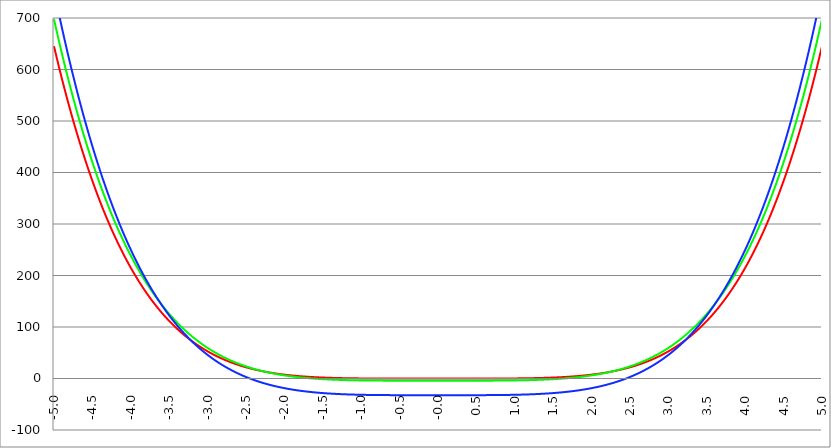
| Category | Series 1 | Series 0 | Series 2 |
|---|---|---|---|
| -5.0 | 645.196 | 697.558 | 753.359 |
| -4.995 | 642.015 | 694.199 | 749.721 |
| -4.99 | 638.847 | 690.853 | 746.097 |
| -4.985 | 635.692 | 687.519 | 742.487 |
| -4.98 | 632.549 | 684.199 | 738.89 |
| -4.975 | 629.419 | 680.891 | 735.307 |
| -4.97 | 626.301 | 677.597 | 731.737 |
| -4.965000000000001 | 623.195 | 674.315 | 728.18 |
| -4.960000000000001 | 620.102 | 671.045 | 724.637 |
| -4.955000000000001 | 617.021 | 667.789 | 721.107 |
| -4.950000000000001 | 613.952 | 664.545 | 717.59 |
| -4.945000000000001 | 610.896 | 661.313 | 714.086 |
| -4.940000000000001 | 607.852 | 658.095 | 710.596 |
| -4.935000000000001 | 604.82 | 654.888 | 707.119 |
| -4.930000000000001 | 601.8 | 651.695 | 703.655 |
| -4.925000000000002 | 598.792 | 648.514 | 700.204 |
| -4.920000000000002 | 595.796 | 645.345 | 696.766 |
| -4.915000000000002 | 592.813 | 642.188 | 693.341 |
| -4.910000000000002 | 589.841 | 639.044 | 689.929 |
| -4.905000000000002 | 586.881 | 635.913 | 686.53 |
| -4.900000000000002 | 583.934 | 632.793 | 683.144 |
| -4.895000000000002 | 580.998 | 629.686 | 679.77 |
| -4.890000000000002 | 578.074 | 626.591 | 676.41 |
| -4.885000000000002 | 575.161 | 623.509 | 673.062 |
| -4.880000000000002 | 572.261 | 620.438 | 669.727 |
| -4.875000000000003 | 569.372 | 617.379 | 666.405 |
| -4.870000000000003 | 566.495 | 614.333 | 663.095 |
| -4.865000000000003 | 563.63 | 611.299 | 659.798 |
| -4.860000000000003 | 560.776 | 608.276 | 656.514 |
| -4.855000000000003 | 557.934 | 605.266 | 653.242 |
| -4.850000000000003 | 555.104 | 602.267 | 649.983 |
| -4.845000000000003 | 552.285 | 599.281 | 646.736 |
| -4.840000000000003 | 549.477 | 596.306 | 643.502 |
| -4.835000000000003 | 546.681 | 593.343 | 640.28 |
| -4.830000000000004 | 543.897 | 590.392 | 637.07 |
| -4.825000000000004 | 541.123 | 587.453 | 633.873 |
| -4.820000000000004 | 538.362 | 584.525 | 630.688 |
| -4.815000000000004 | 535.611 | 581.609 | 627.516 |
| -4.810000000000004 | 532.872 | 578.705 | 624.355 |
| -4.805000000000004 | 530.144 | 575.812 | 621.207 |
| -4.800000000000004 | 527.427 | 572.931 | 618.071 |
| -4.795000000000004 | 524.721 | 570.061 | 614.947 |
| -4.790000000000004 | 522.027 | 567.203 | 611.835 |
| -4.785000000000004 | 519.344 | 564.356 | 608.735 |
| -4.780000000000004 | 516.671 | 561.521 | 605.648 |
| -4.775000000000004 | 514.01 | 558.697 | 602.572 |
| -4.770000000000004 | 511.36 | 555.885 | 599.508 |
| -4.765000000000005 | 508.721 | 553.084 | 596.456 |
| -4.760000000000005 | 506.092 | 550.294 | 593.416 |
| -4.755000000000005 | 503.475 | 547.515 | 590.388 |
| -4.750000000000005 | 500.868 | 544.748 | 587.372 |
| -4.745000000000005 | 498.273 | 541.992 | 584.367 |
| -4.740000000000005 | 495.688 | 539.247 | 581.374 |
| -4.735000000000005 | 493.114 | 536.513 | 578.393 |
| -4.730000000000005 | 490.55 | 533.79 | 575.424 |
| -4.725000000000006 | 487.997 | 531.078 | 572.466 |
| -4.720000000000006 | 485.455 | 528.378 | 569.519 |
| -4.715000000000006 | 482.924 | 525.688 | 566.585 |
| -4.710000000000006 | 480.403 | 523.009 | 563.661 |
| -4.705000000000006 | 477.893 | 520.341 | 560.75 |
| -4.700000000000006 | 475.393 | 517.684 | 557.85 |
| -4.695000000000006 | 472.904 | 515.038 | 554.961 |
| -4.690000000000006 | 470.425 | 512.403 | 552.083 |
| -4.685000000000007 | 467.957 | 509.778 | 549.217 |
| -4.680000000000007 | 465.499 | 507.164 | 546.363 |
| -4.675000000000007 | 463.051 | 504.561 | 543.519 |
| -4.670000000000007 | 460.614 | 501.969 | 540.687 |
| -4.665000000000007 | 458.187 | 499.387 | 537.866 |
| -4.660000000000007 | 455.771 | 496.816 | 535.056 |
| -4.655000000000007 | 453.364 | 494.256 | 532.258 |
| -4.650000000000007 | 450.968 | 491.706 | 529.47 |
| -4.645000000000007 | 448.582 | 489.166 | 526.694 |
| -4.640000000000008 | 446.206 | 486.637 | 523.928 |
| -4.635000000000008 | 443.84 | 484.119 | 521.174 |
| -4.630000000000008 | 441.485 | 481.61 | 518.431 |
| -4.625000000000008 | 439.139 | 479.113 | 515.698 |
| -4.620000000000008 | 436.803 | 476.625 | 512.977 |
| -4.615000000000008 | 434.478 | 474.148 | 510.266 |
| -4.610000000000008 | 432.162 | 471.682 | 507.566 |
| -4.605000000000008 | 429.856 | 469.225 | 504.878 |
| -4.600000000000008 | 427.56 | 466.779 | 502.199 |
| -4.595000000000009 | 425.274 | 464.343 | 499.532 |
| -4.590000000000009 | 422.998 | 461.917 | 496.875 |
| -4.585000000000009 | 420.731 | 459.501 | 494.229 |
| -4.580000000000009 | 418.475 | 457.095 | 491.594 |
| -4.57500000000001 | 416.228 | 454.7 | 488.969 |
| -4.57000000000001 | 413.99 | 452.314 | 486.355 |
| -4.565000000000009 | 411.763 | 449.938 | 483.752 |
| -4.560000000000009 | 409.544 | 447.573 | 481.159 |
| -4.555000000000009 | 407.336 | 445.217 | 478.576 |
| -4.55000000000001 | 405.137 | 442.871 | 476.004 |
| -4.54500000000001 | 402.948 | 440.535 | 473.442 |
| -4.54000000000001 | 400.768 | 438.209 | 470.891 |
| -4.53500000000001 | 398.598 | 435.893 | 468.35 |
| -4.53000000000001 | 396.437 | 433.587 | 465.82 |
| -4.52500000000001 | 394.285 | 431.29 | 463.3 |
| -4.52000000000001 | 392.143 | 429.003 | 460.79 |
| -4.51500000000001 | 390.01 | 426.725 | 458.29 |
| -4.51000000000001 | 387.887 | 424.458 | 455.8 |
| -4.505000000000011 | 385.772 | 422.2 | 453.321 |
| -4.500000000000011 | 383.668 | 419.951 | 450.852 |
| -4.495000000000011 | 381.572 | 417.712 | 448.393 |
| -4.490000000000011 | 379.485 | 415.483 | 445.943 |
| -4.485000000000011 | 377.408 | 413.263 | 443.504 |
| -4.480000000000011 | 375.34 | 411.053 | 441.076 |
| -4.475000000000011 | 373.281 | 408.852 | 438.657 |
| -4.470000000000011 | 371.23 | 406.66 | 436.247 |
| -4.465000000000011 | 369.189 | 404.478 | 433.848 |
| -4.460000000000011 | 367.157 | 402.305 | 431.459 |
| -4.455000000000012 | 365.134 | 400.141 | 429.08 |
| -4.450000000000012 | 363.12 | 397.987 | 426.71 |
| -4.445000000000012 | 361.115 | 395.842 | 424.35 |
| -4.440000000000012 | 359.119 | 393.706 | 422 |
| -4.435000000000012 | 357.132 | 391.58 | 419.66 |
| -4.430000000000012 | 355.153 | 389.462 | 417.33 |
| -4.425000000000012 | 353.183 | 387.354 | 415.009 |
| -4.420000000000012 | 351.222 | 385.255 | 412.698 |
| -4.415000000000012 | 349.27 | 383.165 | 410.396 |
| -4.410000000000013 | 347.327 | 381.084 | 408.104 |
| -4.405000000000013 | 345.392 | 379.012 | 405.822 |
| -4.400000000000013 | 343.466 | 376.949 | 403.549 |
| -4.395000000000013 | 341.548 | 374.895 | 401.285 |
| -4.390000000000013 | 339.639 | 372.85 | 399.031 |
| -4.385000000000013 | 337.739 | 370.813 | 396.787 |
| -4.380000000000013 | 335.847 | 368.786 | 394.551 |
| -4.375000000000013 | 333.964 | 366.767 | 392.326 |
| -4.370000000000013 | 332.089 | 364.758 | 390.109 |
| -4.365000000000013 | 330.223 | 362.757 | 387.902 |
| -4.360000000000014 | 328.365 | 360.764 | 385.704 |
| -4.355000000000014 | 326.515 | 358.781 | 383.516 |
| -4.350000000000014 | 324.674 | 356.806 | 381.336 |
| -4.345000000000014 | 322.841 | 354.84 | 379.166 |
| -4.340000000000014 | 321.017 | 352.882 | 377.005 |
| -4.335000000000014 | 319.2 | 350.934 | 374.853 |
| -4.330000000000014 | 317.392 | 348.993 | 372.71 |
| -4.325000000000014 | 315.593 | 347.061 | 370.577 |
| -4.320000000000014 | 313.801 | 345.138 | 368.452 |
| -4.315000000000015 | 312.018 | 343.223 | 366.336 |
| -4.310000000000015 | 310.242 | 341.317 | 364.23 |
| -4.305000000000015 | 308.475 | 339.419 | 362.132 |
| -4.300000000000015 | 306.716 | 337.53 | 360.043 |
| -4.295000000000015 | 304.965 | 335.649 | 357.963 |
| -4.290000000000015 | 303.222 | 333.776 | 355.892 |
| -4.285000000000015 | 301.487 | 331.912 | 353.83 |
| -4.280000000000015 | 299.76 | 330.056 | 351.777 |
| -4.275000000000015 | 298.041 | 328.208 | 349.732 |
| -4.270000000000015 | 296.33 | 326.368 | 347.696 |
| -4.265000000000016 | 294.627 | 324.537 | 345.669 |
| -4.260000000000016 | 292.932 | 322.714 | 343.651 |
| -4.255000000000016 | 291.244 | 320.898 | 341.641 |
| -4.250000000000016 | 289.564 | 319.092 | 339.64 |
| -4.245000000000016 | 287.892 | 317.293 | 337.648 |
| -4.240000000000016 | 286.228 | 315.502 | 335.664 |
| -4.235000000000016 | 284.572 | 313.719 | 333.689 |
| -4.230000000000016 | 282.923 | 311.945 | 331.722 |
| -4.225000000000017 | 281.282 | 310.178 | 329.764 |
| -4.220000000000017 | 279.649 | 308.419 | 327.814 |
| -4.215000000000017 | 278.023 | 306.668 | 325.873 |
| -4.210000000000017 | 276.404 | 304.925 | 323.94 |
| -4.205000000000017 | 274.794 | 303.19 | 322.015 |
| -4.200000000000017 | 273.191 | 301.463 | 320.099 |
| -4.195000000000017 | 271.595 | 299.744 | 318.191 |
| -4.190000000000017 | 270.007 | 298.032 | 316.292 |
| -4.185000000000017 | 268.426 | 296.329 | 314.4 |
| -4.180000000000017 | 266.853 | 294.633 | 312.517 |
| -4.175000000000018 | 265.287 | 292.944 | 310.643 |
| -4.170000000000018 | 263.729 | 291.264 | 308.776 |
| -4.165000000000018 | 262.178 | 289.591 | 306.918 |
| -4.160000000000018 | 260.634 | 287.925 | 305.067 |
| -4.155000000000018 | 259.098 | 286.268 | 303.225 |
| -4.150000000000018 | 257.569 | 284.618 | 301.391 |
| -4.145000000000018 | 256.047 | 282.975 | 299.565 |
| -4.140000000000018 | 254.532 | 281.34 | 297.747 |
| -4.135000000000018 | 253.025 | 279.713 | 295.937 |
| -4.130000000000019 | 251.524 | 278.093 | 294.136 |
| -4.125000000000019 | 250.031 | 276.48 | 292.342 |
| -4.120000000000019 | 248.545 | 274.875 | 290.555 |
| -4.115000000000019 | 247.066 | 273.277 | 288.777 |
| -4.110000000000019 | 245.594 | 271.687 | 287.007 |
| -4.105000000000019 | 244.129 | 270.104 | 285.245 |
| -4.100000000000019 | 242.672 | 268.528 | 283.49 |
| -4.095000000000019 | 241.221 | 266.96 | 281.743 |
| -4.090000000000019 | 239.777 | 265.399 | 280.004 |
| -4.085000000000019 | 238.34 | 263.845 | 278.273 |
| -4.08000000000002 | 236.91 | 262.298 | 276.549 |
| -4.07500000000002 | 235.487 | 260.759 | 274.833 |
| -4.07000000000002 | 234.071 | 259.227 | 273.125 |
| -4.06500000000002 | 232.662 | 257.701 | 271.424 |
| -4.06000000000002 | 231.259 | 256.183 | 269.731 |
| -4.05500000000002 | 229.863 | 254.673 | 268.046 |
| -4.05000000000002 | 228.474 | 253.169 | 266.368 |
| -4.04500000000002 | 227.092 | 251.672 | 264.698 |
| -4.04000000000002 | 225.716 | 250.182 | 263.035 |
| -4.03500000000002 | 224.348 | 248.699 | 261.38 |
| -4.03000000000002 | 222.985 | 247.224 | 259.732 |
| -4.025000000000021 | 221.63 | 245.755 | 258.092 |
| -4.020000000000021 | 220.281 | 244.293 | 256.459 |
| -4.015000000000021 | 218.939 | 242.838 | 254.833 |
| -4.010000000000021 | 217.603 | 241.39 | 253.215 |
| -4.005000000000021 | 216.274 | 239.948 | 251.604 |
| -4.000000000000021 | 214.951 | 238.514 | 250 |
| -3.995000000000021 | 213.635 | 237.086 | 248.404 |
| -3.990000000000021 | 212.325 | 235.665 | 246.815 |
| -3.985000000000022 | 211.022 | 234.251 | 245.233 |
| -3.980000000000022 | 209.725 | 232.844 | 243.658 |
| -3.975000000000022 | 208.435 | 231.443 | 242.09 |
| -3.970000000000022 | 207.151 | 230.049 | 240.53 |
| -3.965000000000022 | 205.873 | 228.661 | 238.977 |
| -3.960000000000022 | 204.602 | 227.281 | 237.431 |
| -3.955000000000022 | 203.337 | 225.907 | 235.892 |
| -3.950000000000022 | 202.078 | 224.539 | 234.36 |
| -3.945000000000022 | 200.826 | 223.178 | 232.835 |
| -3.940000000000023 | 199.58 | 221.823 | 231.317 |
| -3.935000000000023 | 198.34 | 220.475 | 229.806 |
| -3.930000000000023 | 197.106 | 219.134 | 228.302 |
| -3.925000000000023 | 195.878 | 217.799 | 226.805 |
| -3.920000000000023 | 194.657 | 216.47 | 225.315 |
| -3.915000000000023 | 193.441 | 215.148 | 223.832 |
| -3.910000000000023 | 192.232 | 213.832 | 222.355 |
| -3.905000000000023 | 191.029 | 212.523 | 220.886 |
| -3.900000000000023 | 189.832 | 211.219 | 219.423 |
| -3.895000000000023 | 188.64 | 209.923 | 217.967 |
| -3.890000000000024 | 187.455 | 208.632 | 216.518 |
| -3.885000000000024 | 186.276 | 207.348 | 215.075 |
| -3.880000000000024 | 185.103 | 206.07 | 213.639 |
| -3.875000000000024 | 183.936 | 204.798 | 212.21 |
| -3.870000000000024 | 182.774 | 203.533 | 210.788 |
| -3.865000000000024 | 181.619 | 202.273 | 209.372 |
| -3.860000000000024 | 180.469 | 201.02 | 207.963 |
| -3.855000000000024 | 179.326 | 199.773 | 206.561 |
| -3.850000000000024 | 178.188 | 198.532 | 205.165 |
| -3.845000000000025 | 177.056 | 197.297 | 203.775 |
| -3.840000000000025 | 175.929 | 196.068 | 202.392 |
| -3.835000000000025 | 174.809 | 194.846 | 201.016 |
| -3.830000000000025 | 173.694 | 193.629 | 199.646 |
| -3.825000000000025 | 172.585 | 192.418 | 198.283 |
| -3.820000000000025 | 171.482 | 191.213 | 196.926 |
| -3.815000000000025 | 170.384 | 190.015 | 195.575 |
| -3.810000000000025 | 169.292 | 188.822 | 194.231 |
| -3.805000000000025 | 168.205 | 187.635 | 192.893 |
| -3.800000000000026 | 167.124 | 186.454 | 191.562 |
| -3.795000000000026 | 166.049 | 185.278 | 190.237 |
| -3.790000000000026 | 164.979 | 184.109 | 188.918 |
| -3.785000000000026 | 163.915 | 182.945 | 187.605 |
| -3.780000000000026 | 162.857 | 181.788 | 186.299 |
| -3.775000000000026 | 161.803 | 180.636 | 184.999 |
| -3.770000000000026 | 160.756 | 179.489 | 183.705 |
| -3.765000000000026 | 159.714 | 178.349 | 182.417 |
| -3.760000000000026 | 158.677 | 177.214 | 181.136 |
| -3.755000000000026 | 157.645 | 176.085 | 179.86 |
| -3.750000000000027 | 156.619 | 174.962 | 178.591 |
| -3.745000000000027 | 155.599 | 173.844 | 177.328 |
| -3.740000000000027 | 154.583 | 172.732 | 176.071 |
| -3.735000000000027 | 153.573 | 171.625 | 174.819 |
| -3.730000000000027 | 152.569 | 170.524 | 173.574 |
| -3.725000000000027 | 151.569 | 169.429 | 172.335 |
| -3.720000000000027 | 150.575 | 168.339 | 171.102 |
| -3.715000000000027 | 149.586 | 167.255 | 169.875 |
| -3.710000000000027 | 148.603 | 166.176 | 168.654 |
| -3.705000000000028 | 147.624 | 165.102 | 167.439 |
| -3.700000000000028 | 146.651 | 164.034 | 166.229 |
| -3.695000000000028 | 145.683 | 162.972 | 165.026 |
| -3.690000000000028 | 144.72 | 161.915 | 163.828 |
| -3.685000000000028 | 143.762 | 160.863 | 162.637 |
| -3.680000000000028 | 142.809 | 159.817 | 161.451 |
| -3.675000000000028 | 141.861 | 158.776 | 160.27 |
| -3.670000000000028 | 140.919 | 157.74 | 159.096 |
| -3.665000000000028 | 139.981 | 156.71 | 157.927 |
| -3.660000000000028 | 139.049 | 155.685 | 156.764 |
| -3.655000000000029 | 138.121 | 154.665 | 155.607 |
| -3.650000000000029 | 137.198 | 153.65 | 154.456 |
| -3.645000000000029 | 136.281 | 152.641 | 153.31 |
| -3.640000000000029 | 135.368 | 151.637 | 152.169 |
| -3.635000000000029 | 134.46 | 150.638 | 151.035 |
| -3.630000000000029 | 133.557 | 149.644 | 149.906 |
| -3.625000000000029 | 132.659 | 148.655 | 148.782 |
| -3.620000000000029 | 131.766 | 147.672 | 147.664 |
| -3.615000000000029 | 130.878 | 146.694 | 146.552 |
| -3.61000000000003 | 129.994 | 145.72 | 145.445 |
| -3.60500000000003 | 129.115 | 144.752 | 144.344 |
| -3.60000000000003 | 128.241 | 143.789 | 143.248 |
| -3.59500000000003 | 127.372 | 142.831 | 142.157 |
| -3.59000000000003 | 126.508 | 141.877 | 141.072 |
| -3.58500000000003 | 125.648 | 140.929 | 139.993 |
| -3.58000000000003 | 124.793 | 139.986 | 138.918 |
| -3.57500000000003 | 123.942 | 139.048 | 137.85 |
| -3.57000000000003 | 123.097 | 138.114 | 136.786 |
| -3.565000000000031 | 122.255 | 137.186 | 135.728 |
| -3.560000000000031 | 121.419 | 136.262 | 134.675 |
| -3.555000000000031 | 120.587 | 135.343 | 133.627 |
| -3.550000000000031 | 119.76 | 134.429 | 132.585 |
| -3.545000000000031 | 118.937 | 133.52 | 131.548 |
| -3.540000000000031 | 118.119 | 132.616 | 130.516 |
| -3.535000000000031 | 117.305 | 131.717 | 129.489 |
| -3.530000000000031 | 116.496 | 130.822 | 128.468 |
| -3.525000000000031 | 115.691 | 129.932 | 127.452 |
| -3.520000000000032 | 114.891 | 129.047 | 126.441 |
| -3.515000000000032 | 114.095 | 128.166 | 125.435 |
| -3.510000000000032 | 113.304 | 127.291 | 124.434 |
| -3.505000000000032 | 112.517 | 126.419 | 123.438 |
| -3.500000000000032 | 111.735 | 125.553 | 122.447 |
| -3.495000000000032 | 110.956 | 124.691 | 121.461 |
| -3.490000000000032 | 110.183 | 123.834 | 120.481 |
| -3.485000000000032 | 109.413 | 122.981 | 119.505 |
| -3.480000000000032 | 108.648 | 122.133 | 118.534 |
| -3.475000000000032 | 107.887 | 121.29 | 117.569 |
| -3.470000000000033 | 107.131 | 120.451 | 116.608 |
| -3.465000000000033 | 106.378 | 119.616 | 115.652 |
| -3.460000000000033 | 105.63 | 118.786 | 114.701 |
| -3.455000000000033 | 104.886 | 117.961 | 113.755 |
| -3.450000000000033 | 104.147 | 117.14 | 112.814 |
| -3.445000000000033 | 103.411 | 116.323 | 111.878 |
| -3.440000000000033 | 102.68 | 115.511 | 110.946 |
| -3.435000000000033 | 101.953 | 114.703 | 110.02 |
| -3.430000000000033 | 101.23 | 113.9 | 109.098 |
| -3.425000000000034 | 100.511 | 113.101 | 108.181 |
| -3.420000000000034 | 99.797 | 112.307 | 107.269 |
| -3.415000000000034 | 99.086 | 111.516 | 106.361 |
| -3.410000000000034 | 98.379 | 110.73 | 105.458 |
| -3.405000000000034 | 97.677 | 109.949 | 104.56 |
| -3.400000000000034 | 96.978 | 109.171 | 103.667 |
| -3.395000000000034 | 96.284 | 108.398 | 102.778 |
| -3.390000000000034 | 95.594 | 107.63 | 101.894 |
| -3.385000000000034 | 94.907 | 106.865 | 101.014 |
| -3.380000000000034 | 94.225 | 106.105 | 100.14 |
| -3.375000000000035 | 93.546 | 105.348 | 99.269 |
| -3.370000000000035 | 92.871 | 104.596 | 98.404 |
| -3.365000000000035 | 92.201 | 103.849 | 97.542 |
| -3.360000000000035 | 91.534 | 103.105 | 96.686 |
| -3.355000000000035 | 90.871 | 102.365 | 95.834 |
| -3.350000000000035 | 90.212 | 101.63 | 94.986 |
| -3.345000000000035 | 89.556 | 100.898 | 94.143 |
| -3.340000000000035 | 88.905 | 100.171 | 93.305 |
| -3.335000000000035 | 88.257 | 99.448 | 92.47 |
| -3.330000000000036 | 87.613 | 98.729 | 91.641 |
| -3.325000000000036 | 86.973 | 98.014 | 90.815 |
| -3.320000000000036 | 86.337 | 97.302 | 89.994 |
| -3.315000000000036 | 85.705 | 96.595 | 89.178 |
| -3.310000000000036 | 85.076 | 95.892 | 88.366 |
| -3.305000000000036 | 84.451 | 95.193 | 87.558 |
| -3.300000000000036 | 83.829 | 94.497 | 86.754 |
| -3.295000000000036 | 83.211 | 93.806 | 85.955 |
| -3.290000000000036 | 82.597 | 93.119 | 85.16 |
| -3.285000000000036 | 81.987 | 92.435 | 84.37 |
| -3.280000000000036 | 81.38 | 91.755 | 83.583 |
| -3.275000000000037 | 80.777 | 91.079 | 82.801 |
| -3.270000000000037 | 80.177 | 90.407 | 82.023 |
| -3.265000000000037 | 79.581 | 89.739 | 81.249 |
| -3.260000000000037 | 78.989 | 89.075 | 80.48 |
| -3.255000000000037 | 78.4 | 88.414 | 79.714 |
| -3.250000000000037 | 77.814 | 87.757 | 78.953 |
| -3.245000000000037 | 77.233 | 87.104 | 78.196 |
| -3.240000000000037 | 76.654 | 86.455 | 77.443 |
| -3.235000000000038 | 76.079 | 85.809 | 76.694 |
| -3.230000000000038 | 75.508 | 85.167 | 75.949 |
| -3.225000000000038 | 74.94 | 84.529 | 75.209 |
| -3.220000000000038 | 74.375 | 83.894 | 74.472 |
| -3.215000000000038 | 73.814 | 83.263 | 73.739 |
| -3.210000000000038 | 73.256 | 82.636 | 73.011 |
| -3.205000000000038 | 72.702 | 82.012 | 72.286 |
| -3.200000000000038 | 72.151 | 81.392 | 71.565 |
| -3.195000000000038 | 71.603 | 80.776 | 70.849 |
| -3.190000000000039 | 71.059 | 80.163 | 70.136 |
| -3.185000000000039 | 70.518 | 79.553 | 69.427 |
| -3.180000000000039 | 69.981 | 78.948 | 68.722 |
| -3.175000000000039 | 69.446 | 78.345 | 68.021 |
| -3.170000000000039 | 68.915 | 77.747 | 67.324 |
| -3.16500000000004 | 68.387 | 77.151 | 66.631 |
| -3.16000000000004 | 67.863 | 76.56 | 65.942 |
| -3.155000000000039 | 67.342 | 75.971 | 65.256 |
| -3.150000000000039 | 66.823 | 75.386 | 64.574 |
| -3.14500000000004 | 66.309 | 74.805 | 63.897 |
| -3.14000000000004 | 65.797 | 74.227 | 63.222 |
| -3.13500000000004 | 65.288 | 73.652 | 62.552 |
| -3.13000000000004 | 64.783 | 73.081 | 61.885 |
| -3.12500000000004 | 64.281 | 72.513 | 61.223 |
| -3.12000000000004 | 63.782 | 71.949 | 60.563 |
| -3.11500000000004 | 63.286 | 71.388 | 59.908 |
| -3.11000000000004 | 62.793 | 70.83 | 59.256 |
| -3.10500000000004 | 62.303 | 70.276 | 58.608 |
| -3.10000000000004 | 61.816 | 69.724 | 57.964 |
| -3.095000000000041 | 61.333 | 69.177 | 57.323 |
| -3.090000000000041 | 60.852 | 68.632 | 56.686 |
| -3.085000000000041 | 60.374 | 68.091 | 56.052 |
| -3.080000000000041 | 59.9 | 67.553 | 55.422 |
| -3.075000000000041 | 59.428 | 67.018 | 54.796 |
| -3.070000000000041 | 58.96 | 66.486 | 54.173 |
| -3.065000000000041 | 58.494 | 65.957 | 53.554 |
| -3.060000000000041 | 58.031 | 65.432 | 52.938 |
| -3.055000000000041 | 57.572 | 64.91 | 52.326 |
| -3.050000000000042 | 57.115 | 64.391 | 51.718 |
| -3.045000000000042 | 56.661 | 63.875 | 51.112 |
| -3.040000000000042 | 56.21 | 63.362 | 50.511 |
| -3.035000000000042 | 55.762 | 62.853 | 49.913 |
| -3.030000000000042 | 55.317 | 62.346 | 49.318 |
| -3.025000000000042 | 54.874 | 61.843 | 48.726 |
| -3.020000000000042 | 54.435 | 61.343 | 48.138 |
| -3.015000000000042 | 53.998 | 60.845 | 47.554 |
| -3.010000000000042 | 53.564 | 60.351 | 46.973 |
| -3.005000000000043 | 53.133 | 59.86 | 46.395 |
| -3.000000000000043 | 52.705 | 59.371 | 45.821 |
| -2.995000000000043 | 52.279 | 58.886 | 45.249 |
| -2.990000000000043 | 51.856 | 58.404 | 44.682 |
| -2.985000000000043 | 51.436 | 57.925 | 44.117 |
| -2.980000000000043 | 51.019 | 57.448 | 43.556 |
| -2.975000000000043 | 50.604 | 56.975 | 42.998 |
| -2.970000000000043 | 50.193 | 56.504 | 42.444 |
| -2.965000000000043 | 49.783 | 56.037 | 41.892 |
| -2.960000000000043 | 49.377 | 55.572 | 41.344 |
| -2.955000000000044 | 48.973 | 55.11 | 40.799 |
| -2.950000000000044 | 48.572 | 54.651 | 40.258 |
| -2.945000000000044 | 48.174 | 54.195 | 39.719 |
| -2.940000000000044 | 47.778 | 53.742 | 39.184 |
| -2.935000000000044 | 47.384 | 53.292 | 38.652 |
| -2.930000000000044 | 46.994 | 52.844 | 38.123 |
| -2.925000000000044 | 46.606 | 52.399 | 37.597 |
| -2.920000000000044 | 46.22 | 51.957 | 37.074 |
| -2.915000000000044 | 45.837 | 51.518 | 36.555 |
| -2.910000000000045 | 45.457 | 51.082 | 36.038 |
| -2.905000000000045 | 45.079 | 50.648 | 35.525 |
| -2.900000000000045 | 44.704 | 50.217 | 35.014 |
| -2.895000000000045 | 44.331 | 49.789 | 34.507 |
| -2.890000000000045 | 43.96 | 49.363 | 34.003 |
| -2.885000000000045 | 43.593 | 48.941 | 33.502 |
| -2.880000000000045 | 43.227 | 48.52 | 33.003 |
| -2.875000000000045 | 42.864 | 48.103 | 32.508 |
| -2.870000000000045 | 42.504 | 47.688 | 32.016 |
| -2.865000000000045 | 42.146 | 47.276 | 31.527 |
| -2.860000000000046 | 41.79 | 46.866 | 31.04 |
| -2.855000000000046 | 41.437 | 46.46 | 30.557 |
| -2.850000000000046 | 41.086 | 46.055 | 30.077 |
| -2.845000000000046 | 40.738 | 45.654 | 29.599 |
| -2.840000000000046 | 40.392 | 45.254 | 29.125 |
| -2.835000000000046 | 40.048 | 44.858 | 28.653 |
| -2.830000000000046 | 39.707 | 44.464 | 28.184 |
| -2.825000000000046 | 39.368 | 44.072 | 27.718 |
| -2.820000000000046 | 39.031 | 43.684 | 27.255 |
| -2.815000000000047 | 38.697 | 43.297 | 26.795 |
| -2.810000000000047 | 38.365 | 42.913 | 26.337 |
| -2.805000000000047 | 38.035 | 42.532 | 25.883 |
| -2.800000000000047 | 37.708 | 42.153 | 25.431 |
| -2.795000000000047 | 37.382 | 41.777 | 24.982 |
| -2.790000000000047 | 37.059 | 41.403 | 24.536 |
| -2.785000000000047 | 36.739 | 41.031 | 24.092 |
| -2.780000000000047 | 36.42 | 40.662 | 23.651 |
| -2.775000000000047 | 36.104 | 40.295 | 23.213 |
| -2.770000000000047 | 35.79 | 39.931 | 22.778 |
| -2.765000000000048 | 35.478 | 39.569 | 22.345 |
| -2.760000000000048 | 35.168 | 39.21 | 21.916 |
| -2.755000000000048 | 34.861 | 38.852 | 21.488 |
| -2.750000000000048 | 34.556 | 38.498 | 21.064 |
| -2.745000000000048 | 34.252 | 38.145 | 20.642 |
| -2.740000000000048 | 33.951 | 37.795 | 20.223 |
| -2.735000000000048 | 33.652 | 37.447 | 19.806 |
| -2.730000000000048 | 33.355 | 37.102 | 19.392 |
| -2.725000000000048 | 33.061 | 36.759 | 18.981 |
| -2.720000000000049 | 32.768 | 36.418 | 18.572 |
| -2.715000000000049 | 32.478 | 36.079 | 18.166 |
| -2.710000000000049 | 32.189 | 35.743 | 17.762 |
| -2.705000000000049 | 31.903 | 35.409 | 17.361 |
| -2.700000000000049 | 31.618 | 35.077 | 16.963 |
| -2.695000000000049 | 31.336 | 34.748 | 16.567 |
| -2.690000000000049 | 31.056 | 34.42 | 16.174 |
| -2.685000000000049 | 30.777 | 34.095 | 15.783 |
| -2.680000000000049 | 30.501 | 33.772 | 15.394 |
| -2.675000000000049 | 30.227 | 33.452 | 15.008 |
| -2.67000000000005 | 29.954 | 33.133 | 14.625 |
| -2.66500000000005 | 29.684 | 32.817 | 14.244 |
| -2.66000000000005 | 29.416 | 32.502 | 13.865 |
| -2.65500000000005 | 29.149 | 32.19 | 13.489 |
| -2.65000000000005 | 28.885 | 31.88 | 13.116 |
| -2.64500000000005 | 28.622 | 31.572 | 12.744 |
| -2.64000000000005 | 28.361 | 31.267 | 12.376 |
| -2.63500000000005 | 28.103 | 30.963 | 12.009 |
| -2.63000000000005 | 27.846 | 30.661 | 11.645 |
| -2.625000000000051 | 27.591 | 30.362 | 11.283 |
| -2.620000000000051 | 27.338 | 30.064 | 10.924 |
| -2.615000000000051 | 27.086 | 29.769 | 10.567 |
| -2.610000000000051 | 26.837 | 29.476 | 10.212 |
| -2.605000000000051 | 26.589 | 29.184 | 9.86 |
| -2.600000000000051 | 26.344 | 28.895 | 9.51 |
| -2.595000000000051 | 26.1 | 28.608 | 9.162 |
| -2.590000000000051 | 25.858 | 28.323 | 8.817 |
| -2.585000000000051 | 25.617 | 28.039 | 8.474 |
| -2.580000000000052 | 25.379 | 27.758 | 8.133 |
| -2.575000000000052 | 25.142 | 27.479 | 7.794 |
| -2.570000000000052 | 24.907 | 27.201 | 7.458 |
| -2.565000000000052 | 24.674 | 26.926 | 7.124 |
| -2.560000000000052 | 24.443 | 26.653 | 6.792 |
| -2.555000000000052 | 24.213 | 26.381 | 6.462 |
| -2.550000000000052 | 23.985 | 26.111 | 6.134 |
| -2.545000000000052 | 23.759 | 25.844 | 5.809 |
| -2.540000000000052 | 23.534 | 25.578 | 5.486 |
| -2.535000000000053 | 23.312 | 25.314 | 5.165 |
| -2.530000000000053 | 23.09 | 25.052 | 4.846 |
| -2.525000000000053 | 22.871 | 24.792 | 4.529 |
| -2.520000000000053 | 22.653 | 24.533 | 4.215 |
| -2.515000000000053 | 22.437 | 24.277 | 3.902 |
| -2.510000000000053 | 22.223 | 24.022 | 3.592 |
| -2.505000000000053 | 22.01 | 23.769 | 3.284 |
| -2.500000000000053 | 21.799 | 23.518 | 2.978 |
| -2.495000000000053 | 21.589 | 23.269 | 2.674 |
| -2.490000000000053 | 21.381 | 23.021 | 2.372 |
| -2.485000000000054 | 21.175 | 22.776 | 2.072 |
| -2.480000000000054 | 20.97 | 22.532 | 1.774 |
| -2.475000000000054 | 20.767 | 22.29 | 1.478 |
| -2.470000000000054 | 20.565 | 22.05 | 1.184 |
| -2.465000000000054 | 20.365 | 21.811 | 0.892 |
| -2.460000000000054 | 20.167 | 21.574 | 0.603 |
| -2.455000000000054 | 19.97 | 21.339 | 0.315 |
| -2.450000000000054 | 19.775 | 21.106 | 0.029 |
| -2.445000000000054 | 19.581 | 20.874 | -0.255 |
| -2.440000000000055 | 19.389 | 20.644 | -0.537 |
| -2.435000000000055 | 19.198 | 20.416 | -0.817 |
| -2.430000000000055 | 19.009 | 20.189 | -1.094 |
| -2.425000000000055 | 18.821 | 19.964 | -1.37 |
| -2.420000000000055 | 18.635 | 19.741 | -1.645 |
| -2.415000000000055 | 18.45 | 19.519 | -1.917 |
| -2.410000000000055 | 18.266 | 19.299 | -2.187 |
| -2.405000000000055 | 18.085 | 19.081 | -2.455 |
| -2.400000000000055 | 17.904 | 18.864 | -2.722 |
| -2.395000000000055 | 17.725 | 18.649 | -2.987 |
| -2.390000000000056 | 17.548 | 18.435 | -3.249 |
| -2.385000000000056 | 17.371 | 18.223 | -3.51 |
| -2.380000000000056 | 17.197 | 18.013 | -3.769 |
| -2.375000000000056 | 17.023 | 17.804 | -4.026 |
| -2.370000000000056 | 16.851 | 17.597 | -4.282 |
| -2.365000000000056 | 16.681 | 17.391 | -4.535 |
| -2.360000000000056 | 16.512 | 17.187 | -4.787 |
| -2.355000000000056 | 16.344 | 16.985 | -5.037 |
| -2.350000000000056 | 16.178 | 16.784 | -5.285 |
| -2.345000000000057 | 16.013 | 16.584 | -5.532 |
| -2.340000000000057 | 15.849 | 16.386 | -5.776 |
| -2.335000000000057 | 15.687 | 16.19 | -6.019 |
| -2.330000000000057 | 15.526 | 15.995 | -6.26 |
| -2.325000000000057 | 15.366 | 15.801 | -6.5 |
| -2.320000000000057 | 15.207 | 15.609 | -6.737 |
| -2.315000000000057 | 15.05 | 15.419 | -6.973 |
| -2.310000000000057 | 14.895 | 15.23 | -7.207 |
| -2.305000000000057 | 14.74 | 15.042 | -7.44 |
| -2.300000000000058 | 14.587 | 14.856 | -7.671 |
| -2.295000000000058 | 14.435 | 14.671 | -7.9 |
| -2.290000000000058 | 14.284 | 14.488 | -8.127 |
| -2.285000000000058 | 14.135 | 14.306 | -8.353 |
| -2.280000000000058 | 13.987 | 14.126 | -8.577 |
| -2.275000000000058 | 13.84 | 13.947 | -8.8 |
| -2.270000000000058 | 13.694 | 13.769 | -9.021 |
| -2.265000000000058 | 13.55 | 13.593 | -9.24 |
| -2.260000000000058 | 13.406 | 13.418 | -9.457 |
| -2.255000000000058 | 13.264 | 13.245 | -9.673 |
| -2.250000000000059 | 13.123 | 13.072 | -9.888 |
| -2.245000000000059 | 12.984 | 12.902 | -10.1 |
| -2.240000000000059 | 12.845 | 12.732 | -10.312 |
| -2.235000000000059 | 12.708 | 12.564 | -10.521 |
| -2.23000000000006 | 12.572 | 12.397 | -10.729 |
| -2.22500000000006 | 12.437 | 12.232 | -10.936 |
| -2.22000000000006 | 12.303 | 12.068 | -11.141 |
| -2.215000000000059 | 12.171 | 11.905 | -11.344 |
| -2.210000000000059 | 12.039 | 11.744 | -11.546 |
| -2.20500000000006 | 11.909 | 11.583 | -11.746 |
| -2.20000000000006 | 11.78 | 11.424 | -11.945 |
| -2.19500000000006 | 11.652 | 11.267 | -12.142 |
| -2.19000000000006 | 11.525 | 11.11 | -12.338 |
| -2.18500000000006 | 11.399 | 10.955 | -12.533 |
| -2.18000000000006 | 11.274 | 10.801 | -12.725 |
| -2.17500000000006 | 11.15 | 10.649 | -12.917 |
| -2.17000000000006 | 11.028 | 10.497 | -13.107 |
| -2.16500000000006 | 10.906 | 10.347 | -13.295 |
| -2.160000000000061 | 10.786 | 10.198 | -13.482 |
| -2.155000000000061 | 10.666 | 10.051 | -13.668 |
| -2.150000000000061 | 10.548 | 9.904 | -13.852 |
| -2.145000000000061 | 10.431 | 9.759 | -14.035 |
| -2.140000000000061 | 10.314 | 9.615 | -14.216 |
| -2.135000000000061 | 10.199 | 9.472 | -14.396 |
| -2.130000000000061 | 10.085 | 9.33 | -14.574 |
| -2.125000000000061 | 9.972 | 9.189 | -14.751 |
| -2.120000000000061 | 9.859 | 9.05 | -14.927 |
| -2.115000000000061 | 9.748 | 8.912 | -15.101 |
| -2.110000000000062 | 9.638 | 8.774 | -15.274 |
| -2.105000000000062 | 9.529 | 8.638 | -15.446 |
| -2.100000000000062 | 9.421 | 8.504 | -15.616 |
| -2.095000000000062 | 9.314 | 8.37 | -15.785 |
| -2.090000000000062 | 9.207 | 8.237 | -15.952 |
| -2.085000000000062 | 9.102 | 8.106 | -16.119 |
| -2.080000000000062 | 8.998 | 7.975 | -16.284 |
| -2.075000000000062 | 8.894 | 7.846 | -16.447 |
| -2.070000000000062 | 8.792 | 7.718 | -16.61 |
| -2.065000000000063 | 8.69 | 7.591 | -16.771 |
| -2.060000000000063 | 8.59 | 7.465 | -16.93 |
| -2.055000000000063 | 8.49 | 7.34 | -17.089 |
| -2.050000000000063 | 8.392 | 7.216 | -17.246 |
| -2.045000000000063 | 8.294 | 7.093 | -17.402 |
| -2.040000000000063 | 8.197 | 6.971 | -17.556 |
| -2.035000000000063 | 8.101 | 6.851 | -17.71 |
| -2.030000000000063 | 8.006 | 6.731 | -17.862 |
| -2.025000000000063 | 7.912 | 6.612 | -18.013 |
| -2.020000000000064 | 7.818 | 6.495 | -18.162 |
| -2.015000000000064 | 7.726 | 6.378 | -18.311 |
| -2.010000000000064 | 7.634 | 6.262 | -18.458 |
| -2.005000000000064 | 7.543 | 6.148 | -18.604 |
| -2.000000000000064 | 7.454 | 6.034 | -18.749 |
| -1.995000000000064 | 7.365 | 5.921 | -18.892 |
| -1.990000000000064 | 7.276 | 5.81 | -19.035 |
| -1.985000000000064 | 7.189 | 5.699 | -19.176 |
| -1.980000000000064 | 7.103 | 5.589 | -19.316 |
| -1.975000000000064 | 7.017 | 5.481 | -19.455 |
| -1.970000000000065 | 6.932 | 5.373 | -19.593 |
| -1.965000000000065 | 6.848 | 5.266 | -19.73 |
| -1.960000000000065 | 6.765 | 5.16 | -19.865 |
| -1.955000000000065 | 6.682 | 5.055 | -19.999 |
| -1.950000000000065 | 6.601 | 4.951 | -20.133 |
| -1.945000000000065 | 6.52 | 4.848 | -20.265 |
| -1.940000000000065 | 6.44 | 4.746 | -20.396 |
| -1.935000000000065 | 6.36 | 4.644 | -20.526 |
| -1.930000000000065 | 6.282 | 4.544 | -20.654 |
| -1.925000000000066 | 6.204 | 4.445 | -20.782 |
| -1.920000000000066 | 6.127 | 4.346 | -20.909 |
| -1.915000000000066 | 6.051 | 4.248 | -21.034 |
| -1.910000000000066 | 5.975 | 4.152 | -21.159 |
| -1.905000000000066 | 5.901 | 4.056 | -21.282 |
| -1.900000000000066 | 5.827 | 3.961 | -21.404 |
| -1.895000000000066 | 5.753 | 3.867 | -21.526 |
| -1.890000000000066 | 5.681 | 3.773 | -21.646 |
| -1.885000000000066 | 5.609 | 3.681 | -21.765 |
| -1.880000000000066 | 5.538 | 3.589 | -21.883 |
| -1.875000000000067 | 5.468 | 3.498 | -22 |
| -1.870000000000067 | 5.398 | 3.408 | -22.116 |
| -1.865000000000067 | 5.329 | 3.319 | -22.231 |
| -1.860000000000067 | 5.261 | 3.231 | -22.345 |
| -1.855000000000067 | 5.193 | 3.144 | -22.458 |
| -1.850000000000067 | 5.126 | 3.057 | -22.571 |
| -1.845000000000067 | 5.06 | 2.971 | -22.682 |
| -1.840000000000067 | 4.994 | 2.886 | -22.792 |
| -1.835000000000067 | 4.929 | 2.802 | -22.901 |
| -1.830000000000068 | 4.865 | 2.718 | -23.009 |
| -1.825000000000068 | 4.802 | 2.636 | -23.116 |
| -1.820000000000068 | 4.739 | 2.554 | -23.222 |
| -1.815000000000068 | 4.676 | 2.473 | -23.328 |
| -1.810000000000068 | 4.615 | 2.392 | -23.432 |
| -1.805000000000068 | 4.554 | 2.313 | -23.536 |
| -1.800000000000068 | 4.493 | 2.234 | -23.638 |
| -1.795000000000068 | 4.434 | 2.156 | -23.74 |
| -1.790000000000068 | 4.375 | 2.078 | -23.84 |
| -1.785000000000068 | 4.316 | 2.002 | -23.94 |
| -1.780000000000069 | 4.258 | 1.926 | -24.039 |
| -1.775000000000069 | 4.201 | 1.851 | -24.137 |
| -1.770000000000069 | 4.144 | 1.776 | -24.234 |
| -1.765000000000069 | 4.088 | 1.703 | -24.33 |
| -1.760000000000069 | 4.033 | 1.63 | -24.425 |
| -1.75500000000007 | 3.978 | 1.557 | -24.519 |
| -1.75000000000007 | 3.924 | 1.486 | -24.613 |
| -1.745000000000069 | 3.87 | 1.415 | -24.706 |
| -1.740000000000069 | 3.817 | 1.345 | -24.797 |
| -1.73500000000007 | 3.764 | 1.275 | -24.888 |
| -1.73000000000007 | 3.712 | 1.207 | -24.978 |
| -1.72500000000007 | 3.661 | 1.138 | -25.068 |
| -1.72000000000007 | 3.61 | 1.071 | -25.156 |
| -1.71500000000007 | 3.559 | 1.004 | -25.244 |
| -1.71000000000007 | 3.51 | 0.938 | -25.33 |
| -1.70500000000007 | 3.46 | 0.873 | -25.416 |
| -1.70000000000007 | 3.412 | 0.808 | -25.501 |
| -1.69500000000007 | 3.363 | 0.744 | -25.586 |
| -1.69000000000007 | 3.316 | 0.68 | -25.669 |
| -1.685000000000071 | 3.269 | 0.617 | -25.752 |
| -1.680000000000071 | 3.222 | 0.555 | -25.834 |
| -1.675000000000071 | 3.176 | 0.493 | -25.915 |
| -1.670000000000071 | 3.13 | 0.432 | -25.995 |
| -1.665000000000071 | 3.085 | 0.372 | -26.075 |
| -1.660000000000071 | 3.041 | 0.312 | -26.154 |
| -1.655000000000071 | 2.997 | 0.253 | -26.232 |
| -1.650000000000071 | 2.953 | 0.195 | -26.309 |
| -1.645000000000071 | 2.91 | 0.137 | -26.385 |
| -1.640000000000072 | 2.867 | 0.079 | -26.461 |
| -1.635000000000072 | 2.825 | 0.023 | -26.536 |
| -1.630000000000072 | 2.784 | -0.034 | -26.611 |
| -1.625000000000072 | 2.742 | -0.089 | -26.684 |
| -1.620000000000072 | 2.702 | -0.144 | -26.757 |
| -1.615000000000072 | 2.661 | -0.199 | -26.829 |
| -1.610000000000072 | 2.622 | -0.252 | -26.9 |
| -1.605000000000072 | 2.582 | -0.306 | -26.971 |
| -1.600000000000072 | 2.544 | -0.358 | -27.041 |
| -1.595000000000073 | 2.505 | -0.411 | -27.11 |
| -1.590000000000073 | 2.467 | -0.462 | -27.179 |
| -1.585000000000073 | 2.43 | -0.513 | -27.247 |
| -1.580000000000073 | 2.392 | -0.564 | -27.314 |
| -1.575000000000073 | 2.356 | -0.614 | -27.381 |
| -1.570000000000073 | 2.32 | -0.663 | -27.447 |
| -1.565000000000073 | 2.284 | -0.712 | -27.512 |
| -1.560000000000073 | 2.248 | -0.761 | -27.576 |
| -1.555000000000073 | 2.213 | -0.809 | -27.64 |
| -1.550000000000074 | 2.179 | -0.856 | -27.703 |
| -1.545000000000074 | 2.145 | -0.903 | -27.766 |
| -1.540000000000074 | 2.111 | -0.949 | -27.828 |
| -1.535000000000074 | 2.078 | -0.995 | -27.889 |
| -1.530000000000074 | 2.045 | -1.04 | -27.95 |
| -1.525000000000074 | 2.012 | -1.085 | -28.01 |
| -1.520000000000074 | 1.98 | -1.13 | -28.069 |
| -1.515000000000074 | 1.948 | -1.173 | -28.128 |
| -1.510000000000074 | 1.917 | -1.217 | -28.186 |
| -1.505000000000074 | 1.886 | -1.26 | -28.243 |
| -1.500000000000075 | 1.855 | -1.302 | -28.3 |
| -1.495000000000075 | 1.825 | -1.344 | -28.357 |
| -1.490000000000075 | 1.795 | -1.386 | -28.412 |
| -1.485000000000075 | 1.766 | -1.427 | -28.467 |
| -1.480000000000075 | 1.737 | -1.467 | -28.522 |
| -1.475000000000075 | 1.708 | -1.507 | -28.576 |
| -1.470000000000075 | 1.679 | -1.547 | -28.629 |
| -1.465000000000075 | 1.651 | -1.586 | -28.682 |
| -1.460000000000075 | 1.624 | -1.625 | -28.734 |
| -1.455000000000076 | 1.596 | -1.663 | -28.786 |
| -1.450000000000076 | 1.569 | -1.701 | -28.837 |
| -1.445000000000076 | 1.543 | -1.738 | -28.887 |
| -1.440000000000076 | 1.516 | -1.775 | -28.937 |
| -1.435000000000076 | 1.49 | -1.812 | -28.987 |
| -1.430000000000076 | 1.465 | -1.848 | -29.036 |
| -1.425000000000076 | 1.439 | -1.884 | -29.084 |
| -1.420000000000076 | 1.414 | -1.919 | -29.132 |
| -1.415000000000076 | 1.389 | -1.954 | -29.179 |
| -1.410000000000077 | 1.365 | -1.989 | -29.226 |
| -1.405000000000077 | 1.341 | -2.023 | -29.272 |
| -1.400000000000077 | 1.317 | -2.056 | -29.318 |
| -1.395000000000077 | 1.294 | -2.09 | -29.363 |
| -1.390000000000077 | 1.271 | -2.123 | -29.407 |
| -1.385000000000077 | 1.248 | -2.155 | -29.451 |
| -1.380000000000077 | 1.225 | -2.187 | -29.495 |
| -1.375000000000077 | 1.203 | -2.219 | -29.538 |
| -1.370000000000077 | 1.181 | -2.25 | -29.581 |
| -1.365000000000077 | 1.159 | -2.281 | -29.623 |
| -1.360000000000078 | 1.138 | -2.312 | -29.665 |
| -1.355000000000078 | 1.117 | -2.342 | -29.706 |
| -1.350000000000078 | 1.096 | -2.372 | -29.747 |
| -1.345000000000078 | 1.076 | -2.402 | -29.787 |
| -1.340000000000078 | 1.055 | -2.431 | -29.827 |
| -1.335000000000078 | 1.035 | -2.459 | -29.866 |
| -1.330000000000078 | 1.016 | -2.488 | -29.905 |
| -1.325000000000078 | 0.996 | -2.516 | -29.943 |
| -1.320000000000078 | 0.977 | -2.544 | -29.981 |
| -1.315000000000079 | 0.958 | -2.571 | -30.019 |
| -1.310000000000079 | 0.94 | -2.598 | -30.056 |
| -1.305000000000079 | 0.921 | -2.625 | -30.092 |
| -1.300000000000079 | 0.903 | -2.651 | -30.128 |
| -1.295000000000079 | 0.885 | -2.677 | -30.164 |
| -1.29000000000008 | 0.867 | -2.703 | -30.199 |
| -1.285000000000079 | 0.85 | -2.728 | -30.234 |
| -1.280000000000079 | 0.833 | -2.753 | -30.268 |
| -1.275000000000079 | 0.816 | -2.778 | -30.302 |
| -1.270000000000079 | 0.799 | -2.803 | -30.336 |
| -1.26500000000008 | 0.783 | -2.827 | -30.369 |
| -1.26000000000008 | 0.767 | -2.85 | -30.402 |
| -1.25500000000008 | 0.751 | -2.874 | -30.434 |
| -1.25000000000008 | 0.735 | -2.897 | -30.466 |
| -1.24500000000008 | 0.719 | -2.92 | -30.498 |
| -1.24000000000008 | 0.704 | -2.943 | -30.529 |
| -1.23500000000008 | 0.689 | -2.965 | -30.56 |
| -1.23000000000008 | 0.674 | -2.987 | -30.59 |
| -1.22500000000008 | 0.66 | -3.009 | -30.62 |
| -1.220000000000081 | 0.645 | -3.03 | -30.65 |
| -1.215000000000081 | 0.631 | -3.051 | -30.679 |
| -1.210000000000081 | 0.617 | -3.072 | -30.708 |
| -1.205000000000081 | 0.603 | -3.093 | -30.736 |
| -1.200000000000081 | 0.589 | -3.113 | -30.764 |
| -1.195000000000081 | 0.576 | -3.133 | -30.792 |
| -1.190000000000081 | 0.563 | -3.153 | -30.819 |
| -1.185000000000081 | 0.55 | -3.172 | -30.846 |
| -1.180000000000081 | 0.537 | -3.191 | -30.873 |
| -1.175000000000082 | 0.524 | -3.21 | -30.899 |
| -1.170000000000082 | 0.512 | -3.229 | -30.925 |
| -1.165000000000082 | 0.5 | -3.247 | -30.951 |
| -1.160000000000082 | 0.488 | -3.265 | -30.976 |
| -1.155000000000082 | 0.476 | -3.283 | -31.001 |
| -1.150000000000082 | 0.464 | -3.301 | -31.026 |
| -1.145000000000082 | 0.453 | -3.319 | -31.05 |
| -1.140000000000082 | 0.441 | -3.336 | -31.074 |
| -1.135000000000082 | 0.43 | -3.353 | -31.097 |
| -1.130000000000082 | 0.419 | -3.369 | -31.121 |
| -1.125000000000083 | 0.409 | -3.386 | -31.144 |
| -1.120000000000083 | 0.398 | -3.402 | -31.166 |
| -1.115000000000083 | 0.387 | -3.418 | -31.189 |
| -1.110000000000083 | 0.377 | -3.434 | -31.211 |
| -1.105000000000083 | 0.367 | -3.449 | -31.232 |
| -1.100000000000083 | 0.357 | -3.465 | -31.254 |
| -1.095000000000083 | 0.347 | -3.48 | -31.275 |
| -1.090000000000083 | 0.338 | -3.494 | -31.296 |
| -1.085000000000083 | 0.328 | -3.509 | -31.316 |
| -1.080000000000084 | 0.319 | -3.524 | -31.337 |
| -1.075000000000084 | 0.31 | -3.538 | -31.357 |
| -1.070000000000084 | 0.3 | -3.552 | -31.376 |
| -1.065000000000084 | 0.292 | -3.566 | -31.396 |
| -1.060000000000084 | 0.283 | -3.579 | -31.415 |
| -1.055000000000084 | 0.274 | -3.593 | -31.433 |
| -1.050000000000084 | 0.266 | -3.606 | -31.452 |
| -1.045000000000084 | 0.257 | -3.619 | -31.47 |
| -1.040000000000084 | 0.249 | -3.631 | -31.488 |
| -1.035000000000085 | 0.241 | -3.644 | -31.506 |
| -1.030000000000085 | 0.233 | -3.656 | -31.523 |
| -1.025000000000085 | 0.225 | -3.669 | -31.541 |
| -1.020000000000085 | 0.218 | -3.681 | -31.558 |
| -1.015000000000085 | 0.21 | -3.692 | -31.574 |
| -1.010000000000085 | 0.203 | -3.704 | -31.591 |
| -1.005000000000085 | 0.196 | -3.716 | -31.607 |
| -1.000000000000085 | 0.189 | -3.727 | -31.623 |
| -0.995000000000085 | 0.182 | -3.738 | -31.638 |
| -0.990000000000085 | 0.175 | -3.749 | -31.654 |
| -0.985000000000085 | 0.168 | -3.76 | -31.669 |
| -0.980000000000085 | 0.161 | -3.77 | -31.684 |
| -0.975000000000085 | 0.155 | -3.78 | -31.699 |
| -0.970000000000085 | 0.148 | -3.791 | -31.713 |
| -0.965000000000085 | 0.142 | -3.801 | -31.728 |
| -0.960000000000085 | 0.136 | -3.811 | -31.742 |
| -0.955000000000085 | 0.13 | -3.82 | -31.755 |
| -0.950000000000085 | 0.124 | -3.83 | -31.769 |
| -0.945000000000085 | 0.118 | -3.839 | -31.782 |
| -0.940000000000085 | 0.112 | -3.849 | -31.796 |
| -0.935000000000085 | 0.107 | -3.858 | -31.809 |
| -0.930000000000085 | 0.101 | -3.867 | -31.821 |
| -0.925000000000085 | 0.096 | -3.875 | -31.834 |
| -0.920000000000085 | 0.09 | -3.884 | -31.846 |
| -0.915000000000085 | 0.085 | -3.893 | -31.858 |
| -0.910000000000085 | 0.08 | -3.901 | -31.87 |
| -0.905000000000085 | 0.075 | -3.909 | -31.882 |
| -0.900000000000085 | 0.07 | -3.917 | -31.893 |
| -0.895000000000085 | 0.065 | -3.925 | -31.905 |
| -0.890000000000085 | 0.06 | -3.933 | -31.916 |
| -0.885000000000085 | 0.056 | -3.941 | -31.927 |
| -0.880000000000085 | 0.051 | -3.948 | -31.938 |
| -0.875000000000085 | 0.046 | -3.956 | -31.948 |
| -0.870000000000085 | 0.042 | -3.963 | -31.958 |
| -0.865000000000085 | 0.038 | -3.97 | -31.969 |
| -0.860000000000085 | 0.033 | -3.977 | -31.979 |
| -0.855000000000085 | 0.029 | -3.984 | -31.989 |
| -0.850000000000085 | 0.025 | -3.99 | -31.998 |
| -0.845000000000085 | 0.021 | -3.997 | -32.008 |
| -0.840000000000085 | 0.017 | -4.004 | -32.017 |
| -0.835000000000085 | 0.014 | -4.01 | -32.026 |
| -0.830000000000085 | 0.01 | -4.016 | -32.035 |
| -0.825000000000085 | 0.006 | -4.022 | -32.044 |
| -0.820000000000085 | 0.002 | -4.028 | -32.053 |
| -0.815000000000085 | -0.001 | -4.034 | -32.061 |
| -0.810000000000085 | -0.005 | -4.04 | -32.069 |
| -0.805000000000085 | -0.008 | -4.046 | -32.078 |
| -0.800000000000085 | -0.011 | -4.051 | -32.086 |
| -0.795000000000085 | -0.014 | -4.057 | -32.093 |
| -0.790000000000085 | -0.018 | -4.062 | -32.101 |
| -0.785000000000085 | -0.021 | -4.067 | -32.109 |
| -0.780000000000085 | -0.024 | -4.072 | -32.116 |
| -0.775000000000085 | -0.027 | -4.078 | -32.123 |
| -0.770000000000085 | -0.03 | -4.082 | -32.131 |
| -0.765000000000085 | -0.033 | -4.087 | -32.138 |
| -0.760000000000085 | -0.035 | -4.092 | -32.144 |
| -0.755000000000085 | -0.038 | -4.097 | -32.151 |
| -0.750000000000085 | -0.041 | -4.101 | -32.158 |
| -0.745000000000085 | -0.043 | -4.106 | -32.164 |
| -0.740000000000085 | -0.046 | -4.11 | -32.171 |
| -0.735000000000085 | -0.048 | -4.114 | -32.177 |
| -0.730000000000085 | -0.051 | -4.119 | -32.183 |
| -0.725000000000085 | -0.053 | -4.123 | -32.189 |
| -0.720000000000085 | -0.055 | -4.127 | -32.195 |
| -0.715000000000085 | -0.058 | -4.131 | -32.2 |
| -0.710000000000085 | -0.06 | -4.134 | -32.206 |
| -0.705000000000085 | -0.062 | -4.138 | -32.211 |
| -0.700000000000085 | -0.064 | -4.142 | -32.217 |
| -0.695000000000085 | -0.066 | -4.145 | -32.222 |
| -0.690000000000085 | -0.068 | -4.149 | -32.227 |
| -0.685000000000085 | -0.07 | -4.152 | -32.232 |
| -0.680000000000085 | -0.072 | -4.156 | -32.237 |
| -0.675000000000085 | -0.074 | -4.159 | -32.242 |
| -0.670000000000085 | -0.076 | -4.162 | -32.246 |
| -0.665000000000085 | -0.078 | -4.165 | -32.251 |
| -0.660000000000085 | -0.079 | -4.168 | -32.255 |
| -0.655000000000085 | -0.081 | -4.171 | -32.26 |
| -0.650000000000085 | -0.083 | -4.174 | -32.264 |
| -0.645000000000085 | -0.084 | -4.177 | -32.268 |
| -0.640000000000085 | -0.086 | -4.18 | -32.272 |
| -0.635000000000085 | -0.088 | -4.183 | -32.276 |
| -0.630000000000085 | -0.089 | -4.185 | -32.28 |
| -0.625000000000085 | -0.091 | -4.188 | -32.284 |
| -0.620000000000085 | -0.092 | -4.19 | -32.288 |
| -0.615000000000085 | -0.093 | -4.193 | -32.291 |
| -0.610000000000085 | -0.095 | -4.195 | -32.295 |
| -0.605000000000085 | -0.096 | -4.198 | -32.298 |
| -0.600000000000085 | -0.097 | -4.2 | -32.302 |
| -0.595000000000085 | -0.099 | -4.202 | -32.305 |
| -0.590000000000085 | -0.1 | -4.204 | -32.308 |
| -0.585000000000085 | -0.101 | -4.206 | -32.311 |
| -0.580000000000085 | -0.102 | -4.209 | -32.314 |
| -0.575000000000085 | -0.103 | -4.211 | -32.317 |
| -0.570000000000085 | -0.104 | -4.212 | -32.32 |
| -0.565000000000085 | -0.105 | -4.214 | -32.323 |
| -0.560000000000085 | -0.106 | -4.216 | -32.325 |
| -0.555000000000085 | -0.107 | -4.218 | -32.328 |
| -0.550000000000085 | -0.108 | -4.22 | -32.331 |
| -0.545000000000085 | -0.109 | -4.221 | -32.333 |
| -0.540000000000085 | -0.11 | -4.223 | -32.336 |
| -0.535000000000085 | -0.111 | -4.225 | -32.338 |
| -0.530000000000085 | -0.112 | -4.226 | -32.34 |
| -0.525000000000085 | -0.113 | -4.228 | -32.342 |
| -0.520000000000085 | -0.113 | -4.229 | -32.345 |
| -0.515000000000085 | -0.114 | -4.231 | -32.347 |
| -0.510000000000085 | -0.115 | -4.232 | -32.349 |
| -0.505000000000085 | -0.116 | -4.233 | -32.351 |
| -0.500000000000085 | -0.116 | -4.235 | -32.353 |
| -0.495000000000085 | -0.117 | -4.236 | -32.355 |
| -0.490000000000085 | -0.118 | -4.237 | -32.356 |
| -0.485000000000085 | -0.118 | -4.238 | -32.358 |
| -0.480000000000085 | -0.119 | -4.24 | -32.36 |
| -0.475000000000085 | -0.12 | -4.241 | -32.362 |
| -0.470000000000085 | -0.12 | -4.242 | -32.363 |
| -0.465000000000085 | -0.121 | -4.243 | -32.365 |
| -0.460000000000085 | -0.121 | -4.244 | -32.366 |
| -0.455000000000085 | -0.122 | -4.245 | -32.368 |
| -0.450000000000085 | -0.122 | -4.246 | -32.369 |
| -0.445000000000085 | -0.123 | -4.247 | -32.37 |
| -0.440000000000085 | -0.123 | -4.248 | -32.372 |
| -0.435000000000085 | -0.124 | -4.248 | -32.373 |
| -0.430000000000085 | -0.124 | -4.249 | -32.374 |
| -0.425000000000085 | -0.125 | -4.25 | -32.375 |
| -0.420000000000085 | -0.125 | -4.251 | -32.377 |
| -0.415000000000085 | -0.126 | -4.252 | -32.378 |
| -0.410000000000085 | -0.126 | -4.252 | -32.379 |
| -0.405000000000085 | -0.126 | -4.253 | -32.38 |
| -0.400000000000085 | -0.127 | -4.254 | -32.381 |
| -0.395000000000085 | -0.127 | -4.254 | -32.382 |
| -0.390000000000085 | -0.127 | -4.255 | -32.383 |
| -0.385000000000085 | -0.128 | -4.256 | -32.383 |
| -0.380000000000085 | -0.128 | -4.256 | -32.384 |
| -0.375000000000085 | -0.128 | -4.257 | -32.385 |
| -0.370000000000085 | -0.128 | -4.257 | -32.386 |
| -0.365000000000085 | -0.129 | -4.258 | -32.387 |
| -0.360000000000085 | -0.129 | -4.258 | -32.387 |
| -0.355000000000085 | -0.129 | -4.259 | -32.388 |
| -0.350000000000085 | -0.129 | -4.259 | -32.389 |
| -0.345000000000085 | -0.13 | -4.26 | -32.389 |
| -0.340000000000085 | -0.13 | -4.26 | -32.39 |
| -0.335000000000085 | -0.13 | -4.26 | -32.391 |
| -0.330000000000085 | -0.13 | -4.261 | -32.391 |
| -0.325000000000085 | -0.13 | -4.261 | -32.392 |
| -0.320000000000085 | -0.131 | -4.261 | -32.392 |
| -0.315000000000085 | -0.131 | -4.262 | -32.393 |
| -0.310000000000085 | -0.131 | -4.262 | -32.393 |
| -0.305000000000085 | -0.131 | -4.262 | -32.393 |
| -0.300000000000085 | -0.131 | -4.263 | -32.394 |
| -0.295000000000085 | -0.131 | -4.263 | -32.394 |
| -0.290000000000085 | -0.132 | -4.263 | -32.395 |
| -0.285000000000085 | -0.132 | -4.263 | -32.395 |
| -0.280000000000085 | -0.132 | -4.264 | -32.395 |
| -0.275000000000085 | -0.132 | -4.264 | -32.396 |
| -0.270000000000085 | -0.132 | -4.264 | -32.396 |
| -0.265000000000085 | -0.132 | -4.264 | -32.396 |
| -0.260000000000085 | -0.132 | -4.264 | -32.397 |
| -0.255000000000085 | -0.132 | -4.265 | -32.397 |
| -0.250000000000085 | -0.132 | -4.265 | -32.397 |
| -0.245000000000085 | -0.132 | -4.265 | -32.397 |
| -0.240000000000085 | -0.132 | -4.265 | -32.398 |
| -0.235000000000085 | -0.133 | -4.265 | -32.398 |
| -0.230000000000085 | -0.133 | -4.265 | -32.398 |
| -0.225000000000085 | -0.133 | -4.265 | -32.398 |
| -0.220000000000085 | -0.133 | -4.265 | -32.398 |
| -0.215000000000085 | -0.133 | -4.266 | -32.398 |
| -0.210000000000085 | -0.133 | -4.266 | -32.399 |
| -0.205000000000085 | -0.133 | -4.266 | -32.399 |
| -0.200000000000085 | -0.133 | -4.266 | -32.399 |
| -0.195000000000085 | -0.133 | -4.266 | -32.399 |
| -0.190000000000085 | -0.133 | -4.266 | -32.399 |
| -0.185000000000085 | -0.133 | -4.266 | -32.399 |
| -0.180000000000085 | -0.133 | -4.266 | -32.399 |
| -0.175000000000085 | -0.133 | -4.266 | -32.399 |
| -0.170000000000085 | -0.133 | -4.266 | -32.399 |
| -0.165000000000085 | -0.133 | -4.266 | -32.399 |
| -0.160000000000085 | -0.133 | -4.266 | -32.4 |
| -0.155000000000084 | -0.133 | -4.266 | -32.4 |
| -0.150000000000084 | -0.133 | -4.266 | -32.4 |
| -0.145000000000084 | -0.133 | -4.266 | -32.4 |
| -0.140000000000084 | -0.133 | -4.266 | -32.4 |
| -0.135000000000084 | -0.133 | -4.267 | -32.4 |
| -0.130000000000084 | -0.133 | -4.267 | -32.4 |
| -0.125000000000084 | -0.133 | -4.267 | -32.4 |
| -0.120000000000084 | -0.133 | -4.267 | -32.4 |
| -0.115000000000084 | -0.133 | -4.267 | -32.4 |
| -0.110000000000084 | -0.133 | -4.267 | -32.4 |
| -0.105000000000084 | -0.133 | -4.267 | -32.4 |
| -0.100000000000084 | -0.133 | -4.267 | -32.4 |
| -0.0950000000000844 | -0.133 | -4.267 | -32.4 |
| -0.0900000000000844 | -0.133 | -4.267 | -32.4 |
| -0.0850000000000844 | -0.133 | -4.267 | -32.4 |
| -0.0800000000000844 | -0.133 | -4.267 | -32.4 |
| -0.0750000000000844 | -0.133 | -4.267 | -32.4 |
| -0.0700000000000844 | -0.133 | -4.267 | -32.4 |
| -0.0650000000000844 | -0.133 | -4.267 | -32.4 |
| -0.0600000000000844 | -0.133 | -4.267 | -32.4 |
| -0.0550000000000844 | -0.133 | -4.267 | -32.4 |
| -0.0500000000000844 | -0.133 | -4.267 | -32.4 |
| -0.0450000000000844 | -0.133 | -4.267 | -32.4 |
| -0.0400000000000844 | -0.133 | -4.267 | -32.4 |
| -0.0350000000000844 | -0.133 | -4.267 | -32.4 |
| -0.0300000000000844 | -0.133 | -4.267 | -32.4 |
| -0.0250000000000844 | -0.133 | -4.267 | -32.4 |
| -0.0200000000000844 | -0.133 | -4.267 | -32.4 |
| -0.0150000000000844 | -0.133 | -4.267 | -32.4 |
| -0.0100000000000844 | -0.133 | -4.267 | -32.4 |
| -0.00500000000008444 | -0.133 | -4.267 | -32.4 |
| -8.4444604087075e-14 | -0.133 | -4.267 | -32.4 |
| 0.00499999999991555 | -0.133 | -4.267 | -32.4 |
| 0.00999999999991555 | -0.133 | -4.267 | -32.4 |
| 0.0149999999999156 | -0.133 | -4.267 | -32.4 |
| 0.0199999999999156 | -0.133 | -4.267 | -32.4 |
| 0.0249999999999156 | -0.133 | -4.267 | -32.4 |
| 0.0299999999999156 | -0.133 | -4.267 | -32.4 |
| 0.0349999999999155 | -0.133 | -4.267 | -32.4 |
| 0.0399999999999155 | -0.133 | -4.267 | -32.4 |
| 0.0449999999999155 | -0.133 | -4.267 | -32.4 |
| 0.0499999999999155 | -0.133 | -4.267 | -32.4 |
| 0.0549999999999155 | -0.133 | -4.267 | -32.4 |
| 0.0599999999999155 | -0.133 | -4.267 | -32.4 |
| 0.0649999999999155 | -0.133 | -4.267 | -32.4 |
| 0.0699999999999155 | -0.133 | -4.267 | -32.4 |
| 0.0749999999999155 | -0.133 | -4.267 | -32.4 |
| 0.0799999999999155 | -0.133 | -4.267 | -32.4 |
| 0.0849999999999155 | -0.133 | -4.267 | -32.4 |
| 0.0899999999999155 | -0.133 | -4.267 | -32.4 |
| 0.0949999999999155 | -0.133 | -4.267 | -32.4 |
| 0.0999999999999155 | -0.133 | -4.267 | -32.4 |
| 0.104999999999916 | -0.133 | -4.267 | -32.4 |
| 0.109999999999916 | -0.133 | -4.267 | -32.4 |
| 0.114999999999916 | -0.133 | -4.267 | -32.4 |
| 0.119999999999916 | -0.133 | -4.267 | -32.4 |
| 0.124999999999916 | -0.133 | -4.267 | -32.4 |
| 0.129999999999916 | -0.133 | -4.267 | -32.4 |
| 0.134999999999916 | -0.133 | -4.267 | -32.4 |
| 0.139999999999916 | -0.133 | -4.266 | -32.4 |
| 0.144999999999916 | -0.133 | -4.266 | -32.4 |
| 0.149999999999916 | -0.133 | -4.266 | -32.4 |
| 0.154999999999916 | -0.133 | -4.266 | -32.4 |
| 0.159999999999916 | -0.133 | -4.266 | -32.4 |
| 0.164999999999916 | -0.133 | -4.266 | -32.399 |
| 0.169999999999916 | -0.133 | -4.266 | -32.399 |
| 0.174999999999916 | -0.133 | -4.266 | -32.399 |
| 0.179999999999916 | -0.133 | -4.266 | -32.399 |
| 0.184999999999916 | -0.133 | -4.266 | -32.399 |
| 0.189999999999916 | -0.133 | -4.266 | -32.399 |
| 0.194999999999916 | -0.133 | -4.266 | -32.399 |
| 0.199999999999916 | -0.133 | -4.266 | -32.399 |
| 0.204999999999916 | -0.133 | -4.266 | -32.399 |
| 0.209999999999916 | -0.133 | -4.266 | -32.399 |
| 0.214999999999916 | -0.133 | -4.266 | -32.398 |
| 0.219999999999916 | -0.133 | -4.265 | -32.398 |
| 0.224999999999916 | -0.133 | -4.265 | -32.398 |
| 0.229999999999916 | -0.133 | -4.265 | -32.398 |
| 0.234999999999916 | -0.133 | -4.265 | -32.398 |
| 0.239999999999916 | -0.132 | -4.265 | -32.398 |
| 0.244999999999916 | -0.132 | -4.265 | -32.397 |
| 0.249999999999916 | -0.132 | -4.265 | -32.397 |
| 0.254999999999916 | -0.132 | -4.265 | -32.397 |
| 0.259999999999916 | -0.132 | -4.264 | -32.397 |
| 0.264999999999916 | -0.132 | -4.264 | -32.396 |
| 0.269999999999916 | -0.132 | -4.264 | -32.396 |
| 0.274999999999916 | -0.132 | -4.264 | -32.396 |
| 0.279999999999916 | -0.132 | -4.264 | -32.395 |
| 0.284999999999916 | -0.132 | -4.263 | -32.395 |
| 0.289999999999916 | -0.132 | -4.263 | -32.395 |
| 0.294999999999916 | -0.131 | -4.263 | -32.394 |
| 0.299999999999916 | -0.131 | -4.263 | -32.394 |
| 0.304999999999916 | -0.131 | -4.262 | -32.393 |
| 0.309999999999916 | -0.131 | -4.262 | -32.393 |
| 0.314999999999916 | -0.131 | -4.262 | -32.393 |
| 0.319999999999916 | -0.131 | -4.261 | -32.392 |
| 0.324999999999916 | -0.13 | -4.261 | -32.392 |
| 0.329999999999916 | -0.13 | -4.261 | -32.391 |
| 0.334999999999916 | -0.13 | -4.26 | -32.391 |
| 0.339999999999916 | -0.13 | -4.26 | -32.39 |
| 0.344999999999916 | -0.13 | -4.26 | -32.389 |
| 0.349999999999916 | -0.129 | -4.259 | -32.389 |
| 0.354999999999916 | -0.129 | -4.259 | -32.388 |
| 0.359999999999916 | -0.129 | -4.258 | -32.387 |
| 0.364999999999916 | -0.129 | -4.258 | -32.387 |
| 0.369999999999916 | -0.128 | -4.257 | -32.386 |
| 0.374999999999916 | -0.128 | -4.257 | -32.385 |
| 0.379999999999916 | -0.128 | -4.256 | -32.384 |
| 0.384999999999916 | -0.128 | -4.256 | -32.383 |
| 0.389999999999916 | -0.127 | -4.255 | -32.383 |
| 0.394999999999916 | -0.127 | -4.254 | -32.382 |
| 0.399999999999916 | -0.127 | -4.254 | -32.381 |
| 0.404999999999916 | -0.126 | -4.253 | -32.38 |
| 0.409999999999916 | -0.126 | -4.252 | -32.379 |
| 0.414999999999916 | -0.126 | -4.252 | -32.378 |
| 0.419999999999916 | -0.125 | -4.251 | -32.377 |
| 0.424999999999916 | -0.125 | -4.25 | -32.375 |
| 0.429999999999916 | -0.124 | -4.249 | -32.374 |
| 0.434999999999916 | -0.124 | -4.248 | -32.373 |
| 0.439999999999916 | -0.123 | -4.248 | -32.372 |
| 0.444999999999916 | -0.123 | -4.247 | -32.37 |
| 0.449999999999916 | -0.122 | -4.246 | -32.369 |
| 0.454999999999916 | -0.122 | -4.245 | -32.368 |
| 0.459999999999916 | -0.121 | -4.244 | -32.366 |
| 0.464999999999916 | -0.121 | -4.243 | -32.365 |
| 0.469999999999916 | -0.12 | -4.242 | -32.363 |
| 0.474999999999916 | -0.12 | -4.241 | -32.362 |
| 0.479999999999916 | -0.119 | -4.24 | -32.36 |
| 0.484999999999916 | -0.118 | -4.238 | -32.358 |
| 0.489999999999916 | -0.118 | -4.237 | -32.356 |
| 0.494999999999916 | -0.117 | -4.236 | -32.355 |
| 0.499999999999916 | -0.116 | -4.235 | -32.353 |
| 0.504999999999916 | -0.116 | -4.233 | -32.351 |
| 0.509999999999916 | -0.115 | -4.232 | -32.349 |
| 0.514999999999916 | -0.114 | -4.231 | -32.347 |
| 0.519999999999916 | -0.113 | -4.229 | -32.345 |
| 0.524999999999916 | -0.113 | -4.228 | -32.342 |
| 0.529999999999916 | -0.112 | -4.226 | -32.34 |
| 0.534999999999916 | -0.111 | -4.225 | -32.338 |
| 0.539999999999916 | -0.11 | -4.223 | -32.336 |
| 0.544999999999916 | -0.109 | -4.221 | -32.333 |
| 0.549999999999916 | -0.108 | -4.22 | -32.331 |
| 0.554999999999916 | -0.107 | -4.218 | -32.328 |
| 0.559999999999916 | -0.106 | -4.216 | -32.325 |
| 0.564999999999916 | -0.105 | -4.214 | -32.323 |
| 0.569999999999916 | -0.104 | -4.212 | -32.32 |
| 0.574999999999916 | -0.103 | -4.211 | -32.317 |
| 0.579999999999916 | -0.102 | -4.209 | -32.314 |
| 0.584999999999916 | -0.101 | -4.206 | -32.311 |
| 0.589999999999916 | -0.1 | -4.204 | -32.308 |
| 0.594999999999916 | -0.099 | -4.202 | -32.305 |
| 0.599999999999916 | -0.097 | -4.2 | -32.302 |
| 0.604999999999916 | -0.096 | -4.198 | -32.298 |
| 0.609999999999916 | -0.095 | -4.195 | -32.295 |
| 0.614999999999916 | -0.093 | -4.193 | -32.291 |
| 0.619999999999916 | -0.092 | -4.19 | -32.288 |
| 0.624999999999916 | -0.091 | -4.188 | -32.284 |
| 0.629999999999916 | -0.089 | -4.185 | -32.28 |
| 0.634999999999916 | -0.088 | -4.183 | -32.276 |
| 0.639999999999916 | -0.086 | -4.18 | -32.272 |
| 0.644999999999916 | -0.084 | -4.177 | -32.268 |
| 0.649999999999916 | -0.083 | -4.174 | -32.264 |
| 0.654999999999916 | -0.081 | -4.171 | -32.26 |
| 0.659999999999916 | -0.079 | -4.168 | -32.255 |
| 0.664999999999916 | -0.078 | -4.165 | -32.251 |
| 0.669999999999916 | -0.076 | -4.162 | -32.246 |
| 0.674999999999916 | -0.074 | -4.159 | -32.242 |
| 0.679999999999916 | -0.072 | -4.156 | -32.237 |
| 0.684999999999916 | -0.07 | -4.152 | -32.232 |
| 0.689999999999916 | -0.068 | -4.149 | -32.227 |
| 0.694999999999916 | -0.066 | -4.145 | -32.222 |
| 0.699999999999916 | -0.064 | -4.142 | -32.217 |
| 0.704999999999916 | -0.062 | -4.138 | -32.211 |
| 0.709999999999916 | -0.06 | -4.134 | -32.206 |
| 0.714999999999916 | -0.058 | -4.131 | -32.2 |
| 0.719999999999916 | -0.055 | -4.127 | -32.195 |
| 0.724999999999916 | -0.053 | -4.123 | -32.189 |
| 0.729999999999916 | -0.051 | -4.119 | -32.183 |
| 0.734999999999916 | -0.048 | -4.114 | -32.177 |
| 0.739999999999916 | -0.046 | -4.11 | -32.171 |
| 0.744999999999916 | -0.043 | -4.106 | -32.164 |
| 0.749999999999916 | -0.041 | -4.101 | -32.158 |
| 0.754999999999916 | -0.038 | -4.097 | -32.151 |
| 0.759999999999916 | -0.035 | -4.092 | -32.144 |
| 0.764999999999916 | -0.033 | -4.087 | -32.138 |
| 0.769999999999916 | -0.03 | -4.082 | -32.131 |
| 0.774999999999916 | -0.027 | -4.078 | -32.123 |
| 0.779999999999916 | -0.024 | -4.072 | -32.116 |
| 0.784999999999916 | -0.021 | -4.067 | -32.109 |
| 0.789999999999916 | -0.018 | -4.062 | -32.101 |
| 0.794999999999916 | -0.014 | -4.057 | -32.093 |
| 0.799999999999916 | -0.011 | -4.051 | -32.086 |
| 0.804999999999916 | -0.008 | -4.046 | -32.078 |
| 0.809999999999916 | -0.005 | -4.04 | -32.069 |
| 0.814999999999916 | -0.001 | -4.034 | -32.061 |
| 0.819999999999916 | 0.002 | -4.028 | -32.053 |
| 0.824999999999916 | 0.006 | -4.022 | -32.044 |
| 0.829999999999916 | 0.01 | -4.016 | -32.035 |
| 0.834999999999916 | 0.014 | -4.01 | -32.026 |
| 0.839999999999916 | 0.017 | -4.004 | -32.017 |
| 0.844999999999916 | 0.021 | -3.997 | -32.008 |
| 0.849999999999916 | 0.025 | -3.99 | -31.998 |
| 0.854999999999916 | 0.029 | -3.984 | -31.989 |
| 0.859999999999916 | 0.033 | -3.977 | -31.979 |
| 0.864999999999916 | 0.038 | -3.97 | -31.969 |
| 0.869999999999916 | 0.042 | -3.963 | -31.958 |
| 0.874999999999916 | 0.046 | -3.956 | -31.948 |
| 0.879999999999916 | 0.051 | -3.948 | -31.938 |
| 0.884999999999916 | 0.056 | -3.941 | -31.927 |
| 0.889999999999916 | 0.06 | -3.933 | -31.916 |
| 0.894999999999916 | 0.065 | -3.925 | -31.905 |
| 0.899999999999916 | 0.07 | -3.917 | -31.893 |
| 0.904999999999916 | 0.075 | -3.909 | -31.882 |
| 0.909999999999916 | 0.08 | -3.901 | -31.87 |
| 0.914999999999916 | 0.085 | -3.893 | -31.858 |
| 0.919999999999916 | 0.09 | -3.884 | -31.846 |
| 0.924999999999916 | 0.096 | -3.875 | -31.834 |
| 0.929999999999916 | 0.101 | -3.867 | -31.821 |
| 0.934999999999916 | 0.107 | -3.858 | -31.809 |
| 0.939999999999916 | 0.112 | -3.849 | -31.796 |
| 0.944999999999916 | 0.118 | -3.839 | -31.782 |
| 0.949999999999916 | 0.124 | -3.83 | -31.769 |
| 0.954999999999916 | 0.13 | -3.82 | -31.755 |
| 0.959999999999916 | 0.136 | -3.811 | -31.742 |
| 0.964999999999916 | 0.142 | -3.801 | -31.728 |
| 0.969999999999916 | 0.148 | -3.791 | -31.713 |
| 0.974999999999916 | 0.155 | -3.78 | -31.699 |
| 0.979999999999916 | 0.161 | -3.77 | -31.684 |
| 0.984999999999916 | 0.168 | -3.76 | -31.669 |
| 0.989999999999916 | 0.175 | -3.749 | -31.654 |
| 0.994999999999916 | 0.182 | -3.738 | -31.638 |
| 0.999999999999916 | 0.189 | -3.727 | -31.623 |
| 1.004999999999916 | 0.196 | -3.716 | -31.607 |
| 1.009999999999916 | 0.203 | -3.704 | -31.591 |
| 1.014999999999916 | 0.21 | -3.692 | -31.574 |
| 1.019999999999916 | 0.218 | -3.681 | -31.558 |
| 1.024999999999916 | 0.225 | -3.669 | -31.541 |
| 1.029999999999916 | 0.233 | -3.656 | -31.523 |
| 1.034999999999916 | 0.241 | -3.644 | -31.506 |
| 1.039999999999915 | 0.249 | -3.631 | -31.488 |
| 1.044999999999915 | 0.257 | -3.619 | -31.47 |
| 1.049999999999915 | 0.266 | -3.606 | -31.452 |
| 1.054999999999915 | 0.274 | -3.593 | -31.433 |
| 1.059999999999915 | 0.283 | -3.579 | -31.415 |
| 1.064999999999915 | 0.292 | -3.566 | -31.396 |
| 1.069999999999915 | 0.3 | -3.552 | -31.376 |
| 1.074999999999915 | 0.31 | -3.538 | -31.357 |
| 1.079999999999915 | 0.319 | -3.524 | -31.337 |
| 1.084999999999914 | 0.328 | -3.509 | -31.316 |
| 1.089999999999914 | 0.338 | -3.494 | -31.296 |
| 1.094999999999914 | 0.347 | -3.48 | -31.275 |
| 1.099999999999914 | 0.357 | -3.465 | -31.254 |
| 1.104999999999914 | 0.367 | -3.449 | -31.232 |
| 1.109999999999914 | 0.377 | -3.434 | -31.211 |
| 1.114999999999914 | 0.387 | -3.418 | -31.189 |
| 1.119999999999914 | 0.398 | -3.402 | -31.166 |
| 1.124999999999914 | 0.409 | -3.386 | -31.144 |
| 1.129999999999914 | 0.419 | -3.369 | -31.121 |
| 1.134999999999913 | 0.43 | -3.353 | -31.097 |
| 1.139999999999913 | 0.441 | -3.336 | -31.074 |
| 1.144999999999913 | 0.453 | -3.319 | -31.05 |
| 1.149999999999913 | 0.464 | -3.301 | -31.026 |
| 1.154999999999913 | 0.476 | -3.283 | -31.001 |
| 1.159999999999913 | 0.488 | -3.265 | -30.976 |
| 1.164999999999913 | 0.5 | -3.247 | -30.951 |
| 1.169999999999913 | 0.512 | -3.229 | -30.925 |
| 1.174999999999913 | 0.524 | -3.21 | -30.899 |
| 1.179999999999912 | 0.537 | -3.191 | -30.873 |
| 1.184999999999912 | 0.55 | -3.172 | -30.846 |
| 1.189999999999912 | 0.563 | -3.153 | -30.819 |
| 1.194999999999912 | 0.576 | -3.133 | -30.792 |
| 1.199999999999912 | 0.589 | -3.113 | -30.764 |
| 1.204999999999912 | 0.603 | -3.093 | -30.736 |
| 1.209999999999912 | 0.617 | -3.072 | -30.708 |
| 1.214999999999912 | 0.631 | -3.051 | -30.679 |
| 1.219999999999912 | 0.645 | -3.03 | -30.65 |
| 1.224999999999911 | 0.66 | -3.009 | -30.62 |
| 1.229999999999911 | 0.674 | -2.987 | -30.59 |
| 1.234999999999911 | 0.689 | -2.965 | -30.56 |
| 1.239999999999911 | 0.704 | -2.943 | -30.529 |
| 1.244999999999911 | 0.719 | -2.92 | -30.498 |
| 1.249999999999911 | 0.735 | -2.897 | -30.466 |
| 1.254999999999911 | 0.751 | -2.874 | -30.434 |
| 1.259999999999911 | 0.767 | -2.85 | -30.402 |
| 1.264999999999911 | 0.783 | -2.827 | -30.369 |
| 1.269999999999911 | 0.799 | -2.803 | -30.336 |
| 1.27499999999991 | 0.816 | -2.778 | -30.302 |
| 1.27999999999991 | 0.833 | -2.753 | -30.268 |
| 1.28499999999991 | 0.85 | -2.728 | -30.234 |
| 1.28999999999991 | 0.867 | -2.703 | -30.199 |
| 1.29499999999991 | 0.885 | -2.677 | -30.164 |
| 1.29999999999991 | 0.903 | -2.651 | -30.128 |
| 1.30499999999991 | 0.921 | -2.625 | -30.092 |
| 1.30999999999991 | 0.94 | -2.598 | -30.056 |
| 1.31499999999991 | 0.958 | -2.571 | -30.019 |
| 1.319999999999909 | 0.977 | -2.544 | -29.981 |
| 1.324999999999909 | 0.996 | -2.516 | -29.943 |
| 1.329999999999909 | 1.016 | -2.488 | -29.905 |
| 1.334999999999909 | 1.035 | -2.459 | -29.866 |
| 1.339999999999909 | 1.055 | -2.431 | -29.827 |
| 1.344999999999909 | 1.076 | -2.402 | -29.787 |
| 1.349999999999909 | 1.096 | -2.372 | -29.747 |
| 1.354999999999909 | 1.117 | -2.342 | -29.706 |
| 1.359999999999909 | 1.138 | -2.312 | -29.665 |
| 1.364999999999908 | 1.159 | -2.281 | -29.623 |
| 1.369999999999908 | 1.181 | -2.25 | -29.581 |
| 1.374999999999908 | 1.203 | -2.219 | -29.538 |
| 1.379999999999908 | 1.225 | -2.187 | -29.495 |
| 1.384999999999908 | 1.248 | -2.155 | -29.451 |
| 1.389999999999908 | 1.271 | -2.123 | -29.407 |
| 1.394999999999908 | 1.294 | -2.09 | -29.363 |
| 1.399999999999908 | 1.317 | -2.056 | -29.318 |
| 1.404999999999908 | 1.341 | -2.023 | -29.272 |
| 1.409999999999908 | 1.365 | -1.989 | -29.226 |
| 1.414999999999907 | 1.389 | -1.954 | -29.179 |
| 1.419999999999907 | 1.414 | -1.919 | -29.132 |
| 1.424999999999907 | 1.439 | -1.884 | -29.084 |
| 1.429999999999907 | 1.465 | -1.848 | -29.036 |
| 1.434999999999907 | 1.49 | -1.812 | -28.987 |
| 1.439999999999907 | 1.516 | -1.775 | -28.937 |
| 1.444999999999907 | 1.543 | -1.738 | -28.887 |
| 1.449999999999907 | 1.569 | -1.701 | -28.837 |
| 1.454999999999907 | 1.596 | -1.663 | -28.786 |
| 1.459999999999906 | 1.624 | -1.625 | -28.734 |
| 1.464999999999906 | 1.651 | -1.586 | -28.682 |
| 1.469999999999906 | 1.679 | -1.547 | -28.629 |
| 1.474999999999906 | 1.708 | -1.507 | -28.576 |
| 1.479999999999906 | 1.737 | -1.467 | -28.522 |
| 1.484999999999906 | 1.766 | -1.427 | -28.467 |
| 1.489999999999906 | 1.795 | -1.386 | -28.412 |
| 1.494999999999906 | 1.825 | -1.344 | -28.357 |
| 1.499999999999906 | 1.855 | -1.302 | -28.3 |
| 1.504999999999906 | 1.886 | -1.26 | -28.243 |
| 1.509999999999905 | 1.917 | -1.217 | -28.186 |
| 1.514999999999905 | 1.948 | -1.173 | -28.128 |
| 1.519999999999905 | 1.98 | -1.13 | -28.069 |
| 1.524999999999905 | 2.012 | -1.085 | -28.01 |
| 1.529999999999905 | 2.045 | -1.04 | -27.95 |
| 1.534999999999905 | 2.078 | -0.995 | -27.889 |
| 1.539999999999905 | 2.111 | -0.949 | -27.828 |
| 1.544999999999905 | 2.145 | -0.903 | -27.766 |
| 1.549999999999905 | 2.179 | -0.856 | -27.703 |
| 1.554999999999904 | 2.213 | -0.809 | -27.64 |
| 1.559999999999904 | 2.248 | -0.761 | -27.576 |
| 1.564999999999904 | 2.284 | -0.712 | -27.512 |
| 1.569999999999904 | 2.32 | -0.663 | -27.447 |
| 1.574999999999904 | 2.356 | -0.614 | -27.381 |
| 1.579999999999904 | 2.392 | -0.564 | -27.314 |
| 1.584999999999904 | 2.43 | -0.513 | -27.247 |
| 1.589999999999904 | 2.467 | -0.462 | -27.179 |
| 1.594999999999904 | 2.505 | -0.411 | -27.11 |
| 1.599999999999903 | 2.544 | -0.358 | -27.041 |
| 1.604999999999903 | 2.582 | -0.306 | -26.971 |
| 1.609999999999903 | 2.622 | -0.252 | -26.9 |
| 1.614999999999903 | 2.661 | -0.199 | -26.829 |
| 1.619999999999903 | 2.702 | -0.144 | -26.757 |
| 1.624999999999903 | 2.742 | -0.089 | -26.684 |
| 1.629999999999903 | 2.784 | -0.034 | -26.611 |
| 1.634999999999903 | 2.825 | 0.023 | -26.536 |
| 1.639999999999903 | 2.867 | 0.079 | -26.461 |
| 1.644999999999902 | 2.91 | 0.137 | -26.385 |
| 1.649999999999902 | 2.953 | 0.195 | -26.309 |
| 1.654999999999902 | 2.997 | 0.253 | -26.232 |
| 1.659999999999902 | 3.041 | 0.312 | -26.154 |
| 1.664999999999902 | 3.085 | 0.372 | -26.075 |
| 1.669999999999902 | 3.13 | 0.432 | -25.995 |
| 1.674999999999902 | 3.176 | 0.493 | -25.915 |
| 1.679999999999902 | 3.222 | 0.555 | -25.834 |
| 1.684999999999902 | 3.269 | 0.617 | -25.752 |
| 1.689999999999901 | 3.316 | 0.68 | -25.669 |
| 1.694999999999901 | 3.363 | 0.744 | -25.586 |
| 1.699999999999901 | 3.412 | 0.808 | -25.501 |
| 1.704999999999901 | 3.46 | 0.873 | -25.416 |
| 1.709999999999901 | 3.51 | 0.938 | -25.33 |
| 1.714999999999901 | 3.559 | 1.004 | -25.244 |
| 1.719999999999901 | 3.61 | 1.071 | -25.156 |
| 1.724999999999901 | 3.661 | 1.138 | -25.068 |
| 1.729999999999901 | 3.712 | 1.207 | -24.978 |
| 1.734999999999901 | 3.764 | 1.275 | -24.888 |
| 1.7399999999999 | 3.817 | 1.345 | -24.797 |
| 1.7449999999999 | 3.87 | 1.415 | -24.706 |
| 1.7499999999999 | 3.924 | 1.486 | -24.613 |
| 1.7549999999999 | 3.978 | 1.557 | -24.519 |
| 1.7599999999999 | 4.033 | 1.63 | -24.425 |
| 1.7649999999999 | 4.088 | 1.703 | -24.33 |
| 1.7699999999999 | 4.144 | 1.776 | -24.234 |
| 1.7749999999999 | 4.201 | 1.851 | -24.137 |
| 1.7799999999999 | 4.258 | 1.926 | -24.039 |
| 1.784999999999899 | 4.316 | 2.002 | -23.94 |
| 1.789999999999899 | 4.375 | 2.078 | -23.84 |
| 1.794999999999899 | 4.434 | 2.156 | -23.74 |
| 1.799999999999899 | 4.493 | 2.234 | -23.638 |
| 1.804999999999899 | 4.554 | 2.313 | -23.536 |
| 1.809999999999899 | 4.615 | 2.392 | -23.432 |
| 1.814999999999899 | 4.676 | 2.473 | -23.328 |
| 1.819999999999899 | 4.739 | 2.554 | -23.222 |
| 1.824999999999899 | 4.802 | 2.636 | -23.116 |
| 1.829999999999899 | 4.865 | 2.718 | -23.009 |
| 1.834999999999898 | 4.929 | 2.802 | -22.901 |
| 1.839999999999898 | 4.994 | 2.886 | -22.792 |
| 1.844999999999898 | 5.06 | 2.971 | -22.682 |
| 1.849999999999898 | 5.126 | 3.057 | -22.571 |
| 1.854999999999898 | 5.193 | 3.144 | -22.458 |
| 1.859999999999898 | 5.261 | 3.231 | -22.345 |
| 1.864999999999898 | 5.329 | 3.319 | -22.231 |
| 1.869999999999898 | 5.398 | 3.408 | -22.116 |
| 1.874999999999898 | 5.468 | 3.498 | -22 |
| 1.879999999999897 | 5.538 | 3.589 | -21.883 |
| 1.884999999999897 | 5.609 | 3.681 | -21.765 |
| 1.889999999999897 | 5.681 | 3.773 | -21.646 |
| 1.894999999999897 | 5.753 | 3.867 | -21.526 |
| 1.899999999999897 | 5.827 | 3.961 | -21.404 |
| 1.904999999999897 | 5.901 | 4.056 | -21.282 |
| 1.909999999999897 | 5.975 | 4.152 | -21.159 |
| 1.914999999999897 | 6.051 | 4.248 | -21.034 |
| 1.919999999999897 | 6.127 | 4.346 | -20.909 |
| 1.924999999999897 | 6.204 | 4.445 | -20.782 |
| 1.929999999999896 | 6.282 | 4.544 | -20.654 |
| 1.934999999999896 | 6.36 | 4.644 | -20.526 |
| 1.939999999999896 | 6.44 | 4.746 | -20.396 |
| 1.944999999999896 | 6.52 | 4.848 | -20.265 |
| 1.949999999999896 | 6.601 | 4.951 | -20.133 |
| 1.954999999999896 | 6.682 | 5.055 | -19.999 |
| 1.959999999999896 | 6.765 | 5.16 | -19.865 |
| 1.964999999999896 | 6.848 | 5.266 | -19.73 |
| 1.969999999999896 | 6.932 | 5.373 | -19.593 |
| 1.974999999999895 | 7.017 | 5.481 | -19.455 |
| 1.979999999999895 | 7.103 | 5.589 | -19.316 |
| 1.984999999999895 | 7.189 | 5.699 | -19.176 |
| 1.989999999999895 | 7.276 | 5.81 | -19.035 |
| 1.994999999999895 | 7.365 | 5.921 | -18.892 |
| 1.999999999999895 | 7.454 | 6.034 | -18.749 |
| 2.004999999999895 | 7.543 | 6.148 | -18.604 |
| 2.009999999999895 | 7.634 | 6.262 | -18.458 |
| 2.014999999999895 | 7.726 | 6.378 | -18.311 |
| 2.019999999999895 | 7.818 | 6.495 | -18.162 |
| 2.024999999999895 | 7.912 | 6.612 | -18.013 |
| 2.029999999999895 | 8.006 | 6.731 | -17.862 |
| 2.034999999999894 | 8.101 | 6.851 | -17.71 |
| 2.039999999999894 | 8.197 | 6.971 | -17.556 |
| 2.044999999999894 | 8.294 | 7.093 | -17.402 |
| 2.049999999999894 | 8.392 | 7.216 | -17.246 |
| 2.054999999999894 | 8.49 | 7.34 | -17.089 |
| 2.059999999999894 | 8.59 | 7.465 | -16.93 |
| 2.064999999999894 | 8.69 | 7.591 | -16.771 |
| 2.069999999999894 | 8.792 | 7.718 | -16.61 |
| 2.074999999999894 | 8.894 | 7.846 | -16.447 |
| 2.079999999999893 | 8.998 | 7.975 | -16.284 |
| 2.084999999999893 | 9.102 | 8.106 | -16.119 |
| 2.089999999999893 | 9.207 | 8.237 | -15.952 |
| 2.094999999999893 | 9.314 | 8.37 | -15.785 |
| 2.099999999999893 | 9.421 | 8.504 | -15.616 |
| 2.104999999999893 | 9.529 | 8.638 | -15.446 |
| 2.109999999999893 | 9.638 | 8.774 | -15.274 |
| 2.114999999999893 | 9.748 | 8.912 | -15.101 |
| 2.119999999999893 | 9.859 | 9.05 | -14.927 |
| 2.124999999999893 | 9.972 | 9.189 | -14.751 |
| 2.129999999999892 | 10.085 | 9.33 | -14.574 |
| 2.134999999999892 | 10.199 | 9.472 | -14.396 |
| 2.139999999999892 | 10.314 | 9.615 | -14.216 |
| 2.144999999999892 | 10.431 | 9.759 | -14.035 |
| 2.149999999999892 | 10.548 | 9.904 | -13.852 |
| 2.154999999999892 | 10.666 | 10.051 | -13.668 |
| 2.159999999999892 | 10.786 | 10.198 | -13.482 |
| 2.164999999999892 | 10.906 | 10.347 | -13.295 |
| 2.169999999999892 | 11.028 | 10.497 | -13.107 |
| 2.174999999999891 | 11.15 | 10.649 | -12.917 |
| 2.179999999999891 | 11.274 | 10.801 | -12.725 |
| 2.184999999999891 | 11.399 | 10.955 | -12.533 |
| 2.189999999999891 | 11.525 | 11.11 | -12.338 |
| 2.194999999999891 | 11.652 | 11.267 | -12.142 |
| 2.199999999999891 | 11.78 | 11.424 | -11.945 |
| 2.204999999999891 | 11.909 | 11.583 | -11.746 |
| 2.209999999999891 | 12.039 | 11.744 | -11.546 |
| 2.214999999999891 | 12.171 | 11.905 | -11.344 |
| 2.21999999999989 | 12.303 | 12.068 | -11.141 |
| 2.22499999999989 | 12.437 | 12.232 | -10.936 |
| 2.22999999999989 | 12.572 | 12.397 | -10.729 |
| 2.23499999999989 | 12.708 | 12.564 | -10.521 |
| 2.23999999999989 | 12.845 | 12.732 | -10.312 |
| 2.24499999999989 | 12.984 | 12.902 | -10.1 |
| 2.24999999999989 | 13.123 | 13.072 | -9.888 |
| 2.25499999999989 | 13.264 | 13.245 | -9.673 |
| 2.25999999999989 | 13.406 | 13.418 | -9.457 |
| 2.26499999999989 | 13.55 | 13.593 | -9.24 |
| 2.269999999999889 | 13.694 | 13.769 | -9.021 |
| 2.274999999999889 | 13.84 | 13.947 | -8.8 |
| 2.279999999999889 | 13.987 | 14.126 | -8.577 |
| 2.284999999999889 | 14.135 | 14.306 | -8.353 |
| 2.289999999999889 | 14.284 | 14.488 | -8.127 |
| 2.294999999999889 | 14.435 | 14.671 | -7.9 |
| 2.299999999999889 | 14.587 | 14.856 | -7.671 |
| 2.304999999999889 | 14.74 | 15.042 | -7.44 |
| 2.309999999999889 | 14.895 | 15.23 | -7.207 |
| 2.314999999999888 | 15.05 | 15.419 | -6.973 |
| 2.319999999999888 | 15.207 | 15.609 | -6.737 |
| 2.324999999999888 | 15.366 | 15.801 | -6.5 |
| 2.329999999999888 | 15.526 | 15.995 | -6.26 |
| 2.334999999999888 | 15.687 | 16.19 | -6.019 |
| 2.339999999999888 | 15.849 | 16.386 | -5.776 |
| 2.344999999999888 | 16.013 | 16.584 | -5.532 |
| 2.349999999999888 | 16.178 | 16.784 | -5.285 |
| 2.354999999999888 | 16.344 | 16.985 | -5.037 |
| 2.359999999999887 | 16.512 | 17.187 | -4.787 |
| 2.364999999999887 | 16.681 | 17.391 | -4.535 |
| 2.369999999999887 | 16.851 | 17.597 | -4.282 |
| 2.374999999999887 | 17.023 | 17.804 | -4.026 |
| 2.379999999999887 | 17.197 | 18.013 | -3.769 |
| 2.384999999999887 | 17.371 | 18.223 | -3.51 |
| 2.389999999999887 | 17.548 | 18.435 | -3.249 |
| 2.394999999999887 | 17.725 | 18.649 | -2.987 |
| 2.399999999999887 | 17.904 | 18.864 | -2.722 |
| 2.404999999999887 | 18.085 | 19.081 | -2.455 |
| 2.409999999999886 | 18.266 | 19.299 | -2.187 |
| 2.414999999999886 | 18.45 | 19.519 | -1.917 |
| 2.419999999999886 | 18.635 | 19.741 | -1.645 |
| 2.424999999999886 | 18.821 | 19.964 | -1.37 |
| 2.429999999999886 | 19.009 | 20.189 | -1.094 |
| 2.434999999999886 | 19.198 | 20.416 | -0.817 |
| 2.439999999999886 | 19.389 | 20.644 | -0.537 |
| 2.444999999999886 | 19.581 | 20.874 | -0.255 |
| 2.449999999999886 | 19.775 | 21.106 | 0.029 |
| 2.454999999999885 | 19.97 | 21.339 | 0.315 |
| 2.459999999999885 | 20.167 | 21.574 | 0.603 |
| 2.464999999999885 | 20.365 | 21.811 | 0.892 |
| 2.469999999999885 | 20.565 | 22.05 | 1.184 |
| 2.474999999999885 | 20.767 | 22.29 | 1.478 |
| 2.479999999999885 | 20.97 | 22.532 | 1.774 |
| 2.484999999999885 | 21.175 | 22.776 | 2.072 |
| 2.489999999999885 | 21.381 | 23.021 | 2.372 |
| 2.494999999999885 | 21.589 | 23.269 | 2.674 |
| 2.499999999999884 | 21.799 | 23.518 | 2.978 |
| 2.504999999999884 | 22.01 | 23.769 | 3.284 |
| 2.509999999999884 | 22.223 | 24.022 | 3.592 |
| 2.514999999999884 | 22.437 | 24.277 | 3.902 |
| 2.519999999999884 | 22.653 | 24.533 | 4.215 |
| 2.524999999999884 | 22.871 | 24.792 | 4.529 |
| 2.529999999999884 | 23.09 | 25.052 | 4.846 |
| 2.534999999999884 | 23.312 | 25.314 | 5.165 |
| 2.539999999999884 | 23.534 | 25.578 | 5.486 |
| 2.544999999999884 | 23.759 | 25.844 | 5.809 |
| 2.549999999999883 | 23.985 | 26.111 | 6.134 |
| 2.554999999999883 | 24.213 | 26.381 | 6.462 |
| 2.559999999999883 | 24.443 | 26.653 | 6.792 |
| 2.564999999999883 | 24.674 | 26.926 | 7.124 |
| 2.569999999999883 | 24.907 | 27.201 | 7.458 |
| 2.574999999999883 | 25.142 | 27.479 | 7.794 |
| 2.579999999999883 | 25.379 | 27.758 | 8.133 |
| 2.584999999999883 | 25.617 | 28.039 | 8.474 |
| 2.589999999999883 | 25.858 | 28.323 | 8.817 |
| 2.594999999999882 | 26.1 | 28.608 | 9.162 |
| 2.599999999999882 | 26.344 | 28.895 | 9.51 |
| 2.604999999999882 | 26.589 | 29.184 | 9.86 |
| 2.609999999999882 | 26.837 | 29.476 | 10.212 |
| 2.614999999999882 | 27.086 | 29.769 | 10.567 |
| 2.619999999999882 | 27.338 | 30.064 | 10.924 |
| 2.624999999999882 | 27.591 | 30.362 | 11.283 |
| 2.629999999999882 | 27.846 | 30.661 | 11.645 |
| 2.634999999999882 | 28.103 | 30.963 | 12.009 |
| 2.639999999999881 | 28.361 | 31.267 | 12.376 |
| 2.644999999999881 | 28.622 | 31.572 | 12.744 |
| 2.649999999999881 | 28.885 | 31.88 | 13.116 |
| 2.654999999999881 | 29.149 | 32.19 | 13.489 |
| 2.659999999999881 | 29.416 | 32.502 | 13.865 |
| 2.664999999999881 | 29.684 | 32.817 | 14.244 |
| 2.669999999999881 | 29.954 | 33.133 | 14.625 |
| 2.674999999999881 | 30.227 | 33.452 | 15.008 |
| 2.679999999999881 | 30.501 | 33.772 | 15.394 |
| 2.68499999999988 | 30.777 | 34.095 | 15.783 |
| 2.68999999999988 | 31.056 | 34.42 | 16.174 |
| 2.69499999999988 | 31.336 | 34.748 | 16.567 |
| 2.69999999999988 | 31.618 | 35.077 | 16.963 |
| 2.70499999999988 | 31.903 | 35.409 | 17.361 |
| 2.70999999999988 | 32.189 | 35.743 | 17.762 |
| 2.71499999999988 | 32.478 | 36.079 | 18.166 |
| 2.71999999999988 | 32.768 | 36.418 | 18.572 |
| 2.72499999999988 | 33.061 | 36.759 | 18.981 |
| 2.72999999999988 | 33.355 | 37.102 | 19.392 |
| 2.734999999999879 | 33.652 | 37.447 | 19.806 |
| 2.739999999999879 | 33.951 | 37.795 | 20.223 |
| 2.744999999999879 | 34.252 | 38.145 | 20.642 |
| 2.749999999999879 | 34.556 | 38.498 | 21.064 |
| 2.754999999999879 | 34.861 | 38.852 | 21.488 |
| 2.759999999999879 | 35.168 | 39.21 | 21.916 |
| 2.764999999999879 | 35.478 | 39.569 | 22.345 |
| 2.769999999999879 | 35.79 | 39.931 | 22.778 |
| 2.774999999999879 | 36.104 | 40.295 | 23.213 |
| 2.779999999999878 | 36.42 | 40.662 | 23.651 |
| 2.784999999999878 | 36.739 | 41.031 | 24.092 |
| 2.789999999999878 | 37.059 | 41.403 | 24.536 |
| 2.794999999999878 | 37.382 | 41.777 | 24.982 |
| 2.799999999999878 | 37.708 | 42.153 | 25.431 |
| 2.804999999999878 | 38.035 | 42.532 | 25.883 |
| 2.809999999999878 | 38.365 | 42.913 | 26.337 |
| 2.814999999999878 | 38.697 | 43.297 | 26.795 |
| 2.819999999999878 | 39.031 | 43.684 | 27.255 |
| 2.824999999999878 | 39.368 | 44.072 | 27.718 |
| 2.829999999999877 | 39.707 | 44.464 | 28.184 |
| 2.834999999999877 | 40.048 | 44.858 | 28.653 |
| 2.839999999999877 | 40.392 | 45.254 | 29.125 |
| 2.844999999999877 | 40.738 | 45.654 | 29.599 |
| 2.849999999999877 | 41.086 | 46.055 | 30.077 |
| 2.854999999999877 | 41.437 | 46.46 | 30.557 |
| 2.859999999999877 | 41.79 | 46.866 | 31.04 |
| 2.864999999999877 | 42.146 | 47.276 | 31.527 |
| 2.869999999999877 | 42.504 | 47.688 | 32.016 |
| 2.874999999999876 | 42.864 | 48.103 | 32.508 |
| 2.879999999999876 | 43.227 | 48.52 | 33.003 |
| 2.884999999999876 | 43.593 | 48.941 | 33.502 |
| 2.889999999999876 | 43.96 | 49.363 | 34.003 |
| 2.894999999999876 | 44.331 | 49.789 | 34.507 |
| 2.899999999999876 | 44.704 | 50.217 | 35.014 |
| 2.904999999999876 | 45.079 | 50.648 | 35.525 |
| 2.909999999999876 | 45.457 | 51.082 | 36.038 |
| 2.914999999999876 | 45.837 | 51.518 | 36.555 |
| 2.919999999999876 | 46.22 | 51.957 | 37.074 |
| 2.924999999999875 | 46.606 | 52.399 | 37.597 |
| 2.929999999999875 | 46.994 | 52.844 | 38.123 |
| 2.934999999999875 | 47.384 | 53.292 | 38.652 |
| 2.939999999999875 | 47.778 | 53.742 | 39.184 |
| 2.944999999999875 | 48.174 | 54.195 | 39.719 |
| 2.949999999999875 | 48.572 | 54.651 | 40.258 |
| 2.954999999999875 | 48.973 | 55.11 | 40.799 |
| 2.959999999999875 | 49.377 | 55.572 | 41.344 |
| 2.964999999999875 | 49.783 | 56.037 | 41.892 |
| 2.969999999999874 | 50.193 | 56.504 | 42.444 |
| 2.974999999999874 | 50.604 | 56.975 | 42.998 |
| 2.979999999999874 | 51.019 | 57.448 | 43.556 |
| 2.984999999999874 | 51.436 | 57.925 | 44.117 |
| 2.989999999999874 | 51.856 | 58.404 | 44.682 |
| 2.994999999999874 | 52.279 | 58.886 | 45.249 |
| 2.999999999999874 | 52.705 | 59.371 | 45.821 |
| 3.004999999999874 | 53.133 | 59.86 | 46.395 |
| 3.009999999999874 | 53.564 | 60.351 | 46.973 |
| 3.014999999999874 | 53.998 | 60.845 | 47.554 |
| 3.019999999999873 | 54.435 | 61.343 | 48.138 |
| 3.024999999999873 | 54.874 | 61.843 | 48.726 |
| 3.029999999999873 | 55.317 | 62.346 | 49.318 |
| 3.034999999999873 | 55.762 | 62.853 | 49.913 |
| 3.039999999999873 | 56.21 | 63.362 | 50.511 |
| 3.044999999999873 | 56.661 | 63.875 | 51.112 |
| 3.049999999999873 | 57.115 | 64.391 | 51.718 |
| 3.054999999999873 | 57.572 | 64.91 | 52.326 |
| 3.059999999999873 | 58.031 | 65.432 | 52.938 |
| 3.064999999999872 | 58.494 | 65.957 | 53.554 |
| 3.069999999999872 | 58.96 | 66.486 | 54.173 |
| 3.074999999999872 | 59.428 | 67.018 | 54.796 |
| 3.079999999999872 | 59.9 | 67.553 | 55.422 |
| 3.084999999999872 | 60.374 | 68.091 | 56.052 |
| 3.089999999999872 | 60.852 | 68.632 | 56.686 |
| 3.094999999999872 | 61.333 | 69.177 | 57.323 |
| 3.099999999999872 | 61.816 | 69.724 | 57.964 |
| 3.104999999999872 | 62.303 | 70.276 | 58.608 |
| 3.109999999999872 | 62.793 | 70.83 | 59.256 |
| 3.114999999999871 | 63.286 | 71.388 | 59.908 |
| 3.119999999999871 | 63.782 | 71.949 | 60.563 |
| 3.124999999999871 | 64.281 | 72.513 | 61.223 |
| 3.129999999999871 | 64.783 | 73.081 | 61.885 |
| 3.134999999999871 | 65.288 | 73.652 | 62.552 |
| 3.139999999999871 | 65.797 | 74.227 | 63.222 |
| 3.144999999999871 | 66.309 | 74.805 | 63.897 |
| 3.149999999999871 | 66.823 | 75.386 | 64.574 |
| 3.154999999999871 | 67.342 | 75.971 | 65.256 |
| 3.15999999999987 | 67.863 | 76.56 | 65.942 |
| 3.16499999999987 | 68.387 | 77.151 | 66.631 |
| 3.16999999999987 | 68.915 | 77.747 | 67.324 |
| 3.17499999999987 | 69.446 | 78.345 | 68.021 |
| 3.17999999999987 | 69.981 | 78.948 | 68.722 |
| 3.18499999999987 | 70.518 | 79.553 | 69.427 |
| 3.18999999999987 | 71.059 | 80.163 | 70.136 |
| 3.19499999999987 | 71.603 | 80.776 | 70.849 |
| 3.19999999999987 | 72.151 | 81.392 | 71.565 |
| 3.204999999999869 | 72.702 | 82.012 | 72.286 |
| 3.209999999999869 | 73.256 | 82.636 | 73.011 |
| 3.214999999999869 | 73.814 | 83.263 | 73.739 |
| 3.219999999999869 | 74.375 | 83.894 | 74.472 |
| 3.224999999999869 | 74.94 | 84.529 | 75.209 |
| 3.229999999999869 | 75.508 | 85.167 | 75.949 |
| 3.234999999999869 | 76.079 | 85.809 | 76.694 |
| 3.239999999999869 | 76.654 | 86.455 | 77.443 |
| 3.244999999999869 | 77.233 | 87.104 | 78.196 |
| 3.249999999999869 | 77.814 | 87.757 | 78.953 |
| 3.254999999999868 | 78.4 | 88.414 | 79.714 |
| 3.259999999999868 | 78.989 | 89.075 | 80.48 |
| 3.264999999999868 | 79.581 | 89.739 | 81.249 |
| 3.269999999999868 | 80.177 | 90.407 | 82.023 |
| 3.274999999999868 | 80.777 | 91.079 | 82.801 |
| 3.279999999999868 | 81.38 | 91.755 | 83.583 |
| 3.284999999999868 | 81.987 | 92.435 | 84.37 |
| 3.289999999999868 | 82.597 | 93.119 | 85.16 |
| 3.294999999999868 | 83.211 | 93.806 | 85.955 |
| 3.299999999999867 | 83.829 | 94.497 | 86.754 |
| 3.304999999999867 | 84.451 | 95.193 | 87.558 |
| 3.309999999999867 | 85.076 | 95.892 | 88.366 |
| 3.314999999999867 | 85.705 | 96.595 | 89.178 |
| 3.319999999999867 | 86.337 | 97.302 | 89.994 |
| 3.324999999999867 | 86.973 | 98.014 | 90.815 |
| 3.329999999999867 | 87.613 | 98.729 | 91.641 |
| 3.334999999999867 | 88.257 | 99.448 | 92.47 |
| 3.339999999999867 | 88.905 | 100.171 | 93.305 |
| 3.344999999999866 | 89.556 | 100.898 | 94.143 |
| 3.349999999999866 | 90.212 | 101.63 | 94.986 |
| 3.354999999999866 | 90.871 | 102.365 | 95.834 |
| 3.359999999999866 | 91.534 | 103.105 | 96.686 |
| 3.364999999999866 | 92.201 | 103.849 | 97.542 |
| 3.369999999999866 | 92.871 | 104.596 | 98.404 |
| 3.374999999999866 | 93.546 | 105.348 | 99.269 |
| 3.379999999999866 | 94.225 | 106.105 | 100.14 |
| 3.384999999999866 | 94.907 | 106.865 | 101.014 |
| 3.389999999999866 | 95.594 | 107.63 | 101.894 |
| 3.394999999999865 | 96.284 | 108.398 | 102.778 |
| 3.399999999999865 | 96.978 | 109.171 | 103.667 |
| 3.404999999999865 | 97.677 | 109.949 | 104.56 |
| 3.409999999999865 | 98.379 | 110.73 | 105.458 |
| 3.414999999999865 | 99.086 | 111.516 | 106.361 |
| 3.419999999999865 | 99.797 | 112.307 | 107.269 |
| 3.424999999999865 | 100.511 | 113.101 | 108.181 |
| 3.429999999999865 | 101.23 | 113.9 | 109.098 |
| 3.434999999999865 | 101.953 | 114.703 | 110.02 |
| 3.439999999999864 | 102.68 | 115.511 | 110.946 |
| 3.444999999999864 | 103.411 | 116.323 | 111.878 |
| 3.449999999999864 | 104.147 | 117.14 | 112.814 |
| 3.454999999999864 | 104.886 | 117.961 | 113.755 |
| 3.459999999999864 | 105.63 | 118.786 | 114.701 |
| 3.464999999999864 | 106.378 | 119.616 | 115.652 |
| 3.469999999999864 | 107.131 | 120.451 | 116.608 |
| 3.474999999999864 | 107.887 | 121.29 | 117.569 |
| 3.479999999999864 | 108.648 | 122.133 | 118.534 |
| 3.484999999999864 | 109.413 | 122.981 | 119.505 |
| 3.489999999999863 | 110.183 | 123.834 | 120.481 |
| 3.494999999999863 | 110.956 | 124.691 | 121.461 |
| 3.499999999999863 | 111.735 | 125.553 | 122.447 |
| 3.504999999999863 | 112.517 | 126.419 | 123.438 |
| 3.509999999999863 | 113.304 | 127.291 | 124.434 |
| 3.514999999999863 | 114.095 | 128.166 | 125.435 |
| 3.519999999999863 | 114.891 | 129.047 | 126.441 |
| 3.524999999999863 | 115.691 | 129.932 | 127.452 |
| 3.529999999999863 | 116.496 | 130.822 | 128.468 |
| 3.534999999999862 | 117.305 | 131.717 | 129.489 |
| 3.539999999999862 | 118.119 | 132.616 | 130.516 |
| 3.544999999999862 | 118.937 | 133.52 | 131.548 |
| 3.549999999999862 | 119.76 | 134.429 | 132.585 |
| 3.554999999999862 | 120.587 | 135.343 | 133.627 |
| 3.559999999999862 | 121.419 | 136.262 | 134.675 |
| 3.564999999999862 | 122.255 | 137.186 | 135.728 |
| 3.569999999999862 | 123.097 | 138.114 | 136.786 |
| 3.574999999999862 | 123.942 | 139.048 | 137.85 |
| 3.579999999999862 | 124.793 | 139.986 | 138.918 |
| 3.584999999999861 | 125.648 | 140.929 | 139.993 |
| 3.589999999999861 | 126.508 | 141.877 | 141.072 |
| 3.594999999999861 | 127.372 | 142.831 | 142.157 |
| 3.599999999999861 | 128.241 | 143.789 | 143.248 |
| 3.604999999999861 | 129.115 | 144.752 | 144.344 |
| 3.609999999999861 | 129.994 | 145.72 | 145.445 |
| 3.614999999999861 | 130.878 | 146.694 | 146.552 |
| 3.619999999999861 | 131.766 | 147.672 | 147.664 |
| 3.62499999999986 | 132.659 | 148.655 | 148.782 |
| 3.62999999999986 | 133.557 | 149.644 | 149.906 |
| 3.63499999999986 | 134.46 | 150.638 | 151.035 |
| 3.63999999999986 | 135.368 | 151.637 | 152.169 |
| 3.64499999999986 | 136.281 | 152.641 | 153.31 |
| 3.64999999999986 | 137.198 | 153.65 | 154.456 |
| 3.65499999999986 | 138.121 | 154.665 | 155.607 |
| 3.65999999999986 | 139.049 | 155.685 | 156.764 |
| 3.66499999999986 | 139.981 | 156.71 | 157.927 |
| 3.669999999999859 | 140.919 | 157.74 | 159.096 |
| 3.674999999999859 | 141.861 | 158.776 | 160.27 |
| 3.679999999999859 | 142.809 | 159.817 | 161.451 |
| 3.684999999999859 | 143.762 | 160.863 | 162.637 |
| 3.689999999999859 | 144.72 | 161.915 | 163.828 |
| 3.694999999999859 | 145.683 | 162.972 | 165.026 |
| 3.699999999999859 | 146.651 | 164.034 | 166.229 |
| 3.704999999999859 | 147.624 | 165.102 | 167.439 |
| 3.709999999999859 | 148.603 | 166.176 | 168.654 |
| 3.714999999999859 | 149.586 | 167.255 | 169.875 |
| 3.719999999999858 | 150.575 | 168.339 | 171.102 |
| 3.724999999999858 | 151.569 | 169.429 | 172.335 |
| 3.729999999999858 | 152.569 | 170.524 | 173.574 |
| 3.734999999999858 | 153.573 | 171.625 | 174.819 |
| 3.739999999999858 | 154.583 | 172.732 | 176.071 |
| 3.744999999999858 | 155.599 | 173.844 | 177.328 |
| 3.749999999999858 | 156.619 | 174.962 | 178.591 |
| 3.754999999999858 | 157.645 | 176.085 | 179.86 |
| 3.759999999999858 | 158.677 | 177.214 | 181.136 |
| 3.764999999999857 | 159.714 | 178.349 | 182.417 |
| 3.769999999999857 | 160.756 | 179.489 | 183.705 |
| 3.774999999999857 | 161.803 | 180.636 | 184.999 |
| 3.779999999999857 | 162.857 | 181.788 | 186.299 |
| 3.784999999999857 | 163.915 | 182.945 | 187.605 |
| 3.789999999999857 | 164.979 | 184.109 | 188.918 |
| 3.794999999999857 | 166.049 | 185.278 | 190.237 |
| 3.799999999999857 | 167.124 | 186.454 | 191.562 |
| 3.804999999999857 | 168.205 | 187.635 | 192.893 |
| 3.809999999999857 | 169.292 | 188.822 | 194.231 |
| 3.814999999999856 | 170.384 | 190.015 | 195.575 |
| 3.819999999999856 | 171.482 | 191.213 | 196.926 |
| 3.824999999999856 | 172.585 | 192.418 | 198.283 |
| 3.829999999999856 | 173.694 | 193.629 | 199.646 |
| 3.834999999999856 | 174.809 | 194.846 | 201.016 |
| 3.839999999999856 | 175.929 | 196.068 | 202.392 |
| 3.844999999999856 | 177.056 | 197.297 | 203.775 |
| 3.849999999999856 | 178.188 | 198.532 | 205.165 |
| 3.854999999999856 | 179.326 | 199.773 | 206.561 |
| 3.859999999999855 | 180.469 | 201.02 | 207.963 |
| 3.864999999999855 | 181.619 | 202.273 | 209.372 |
| 3.869999999999855 | 182.774 | 203.533 | 210.788 |
| 3.874999999999855 | 183.936 | 204.798 | 212.21 |
| 3.879999999999855 | 185.103 | 206.07 | 213.639 |
| 3.884999999999855 | 186.276 | 207.348 | 215.075 |
| 3.889999999999855 | 187.455 | 208.632 | 216.518 |
| 3.894999999999855 | 188.64 | 209.923 | 217.967 |
| 3.899999999999855 | 189.832 | 211.219 | 219.423 |
| 3.904999999999855 | 191.029 | 212.523 | 220.886 |
| 3.909999999999854 | 192.232 | 213.832 | 222.355 |
| 3.914999999999854 | 193.441 | 215.148 | 223.832 |
| 3.919999999999854 | 194.657 | 216.47 | 225.315 |
| 3.924999999999854 | 195.878 | 217.799 | 226.805 |
| 3.929999999999854 | 197.106 | 219.134 | 228.302 |
| 3.934999999999854 | 198.34 | 220.475 | 229.806 |
| 3.939999999999854 | 199.58 | 221.823 | 231.317 |
| 3.944999999999854 | 200.826 | 223.178 | 232.835 |
| 3.949999999999854 | 202.078 | 224.539 | 234.36 |
| 3.954999999999853 | 203.337 | 225.907 | 235.892 |
| 3.959999999999853 | 204.602 | 227.281 | 237.431 |
| 3.964999999999853 | 205.873 | 228.661 | 238.977 |
| 3.969999999999853 | 207.151 | 230.049 | 240.53 |
| 3.974999999999853 | 208.435 | 231.443 | 242.09 |
| 3.979999999999853 | 209.725 | 232.844 | 243.658 |
| 3.984999999999853 | 211.022 | 234.251 | 245.233 |
| 3.989999999999853 | 212.325 | 235.665 | 246.815 |
| 3.994999999999853 | 213.635 | 237.086 | 248.404 |
| 3.999999999999853 | 214.951 | 238.514 | 250 |
| 4.004999999999852 | 216.274 | 239.948 | 251.604 |
| 4.009999999999852 | 217.603 | 241.39 | 253.215 |
| 4.014999999999852 | 218.939 | 242.838 | 254.833 |
| 4.019999999999852 | 220.281 | 244.293 | 256.459 |
| 4.024999999999852 | 221.63 | 245.755 | 258.092 |
| 4.029999999999852 | 222.985 | 247.224 | 259.732 |
| 4.034999999999852 | 224.348 | 248.699 | 261.38 |
| 4.039999999999851 | 225.716 | 250.182 | 263.035 |
| 4.044999999999852 | 227.092 | 251.672 | 264.698 |
| 4.049999999999851 | 228.474 | 253.169 | 266.368 |
| 4.054999999999851 | 229.863 | 254.673 | 268.046 |
| 4.059999999999851 | 231.259 | 256.183 | 269.731 |
| 4.064999999999851 | 232.662 | 257.701 | 271.424 |
| 4.069999999999851 | 234.071 | 259.227 | 273.125 |
| 4.074999999999851 | 235.487 | 260.759 | 274.833 |
| 4.07999999999985 | 236.91 | 262.298 | 276.549 |
| 4.084999999999851 | 238.34 | 263.845 | 278.273 |
| 4.08999999999985 | 239.777 | 265.399 | 280.004 |
| 4.094999999999851 | 241.221 | 266.96 | 281.743 |
| 4.09999999999985 | 242.672 | 268.528 | 283.49 |
| 4.10499999999985 | 244.129 | 270.104 | 285.245 |
| 4.10999999999985 | 245.594 | 271.687 | 287.007 |
| 4.11499999999985 | 247.066 | 273.277 | 288.777 |
| 4.11999999999985 | 248.545 | 274.875 | 290.555 |
| 4.12499999999985 | 250.031 | 276.48 | 292.342 |
| 4.12999999999985 | 251.524 | 278.093 | 294.136 |
| 4.13499999999985 | 253.025 | 279.713 | 295.937 |
| 4.13999999999985 | 254.532 | 281.34 | 297.747 |
| 4.144999999999849 | 256.047 | 282.975 | 299.565 |
| 4.14999999999985 | 257.569 | 284.618 | 301.391 |
| 4.154999999999849 | 259.098 | 286.268 | 303.225 |
| 4.15999999999985 | 260.634 | 287.925 | 305.067 |
| 4.164999999999849 | 262.178 | 289.591 | 306.918 |
| 4.169999999999849 | 263.729 | 291.264 | 308.776 |
| 4.174999999999849 | 265.287 | 292.944 | 310.643 |
| 4.179999999999848 | 266.853 | 294.633 | 312.517 |
| 4.184999999999849 | 268.426 | 296.329 | 314.4 |
| 4.189999999999848 | 270.007 | 298.032 | 316.292 |
| 4.194999999999848 | 271.595 | 299.744 | 318.191 |
| 4.199999999999848 | 273.191 | 301.463 | 320.099 |
| 4.204999999999848 | 274.794 | 303.19 | 322.015 |
| 4.209999999999848 | 276.404 | 304.925 | 323.94 |
| 4.214999999999848 | 278.023 | 306.668 | 325.873 |
| 4.219999999999847 | 279.649 | 308.419 | 327.814 |
| 4.224999999999848 | 281.282 | 310.178 | 329.764 |
| 4.229999999999847 | 282.923 | 311.945 | 331.722 |
| 4.234999999999847 | 284.572 | 313.719 | 333.689 |
| 4.239999999999847 | 286.228 | 315.502 | 335.664 |
| 4.244999999999847 | 287.892 | 317.293 | 337.648 |
| 4.249999999999847 | 289.564 | 319.092 | 339.64 |
| 4.254999999999847 | 291.244 | 320.898 | 341.641 |
| 4.259999999999846 | 292.932 | 322.714 | 343.651 |
| 4.264999999999847 | 294.627 | 324.537 | 345.669 |
| 4.269999999999846 | 296.33 | 326.368 | 347.696 |
| 4.274999999999846 | 298.041 | 328.208 | 349.732 |
| 4.279999999999846 | 299.76 | 330.056 | 351.777 |
| 4.284999999999846 | 301.487 | 331.912 | 353.83 |
| 4.289999999999846 | 303.222 | 333.776 | 355.892 |
| 4.294999999999846 | 304.965 | 335.649 | 357.963 |
| 4.299999999999846 | 306.716 | 337.53 | 360.043 |
| 4.304999999999846 | 308.475 | 339.419 | 362.132 |
| 4.309999999999845 | 310.242 | 341.317 | 364.23 |
| 4.314999999999846 | 312.018 | 343.223 | 366.336 |
| 4.319999999999845 | 313.801 | 345.138 | 368.452 |
| 4.324999999999846 | 315.593 | 347.061 | 370.577 |
| 4.329999999999845 | 317.392 | 348.993 | 372.71 |
| 4.334999999999845 | 319.2 | 350.934 | 374.853 |
| 4.339999999999845 | 321.017 | 352.882 | 377.005 |
| 4.344999999999845 | 322.841 | 354.84 | 379.166 |
| 4.349999999999845 | 324.674 | 356.806 | 381.336 |
| 4.354999999999845 | 326.515 | 358.781 | 383.516 |
| 4.359999999999844 | 328.365 | 360.764 | 385.704 |
| 4.364999999999845 | 330.223 | 362.757 | 387.902 |
| 4.369999999999844 | 332.089 | 364.758 | 390.109 |
| 4.374999999999844 | 333.964 | 366.767 | 392.326 |
| 4.379999999999844 | 335.847 | 368.786 | 394.551 |
| 4.384999999999844 | 337.739 | 370.813 | 396.787 |
| 4.389999999999844 | 339.639 | 372.85 | 399.031 |
| 4.394999999999844 | 341.548 | 374.895 | 401.285 |
| 4.399999999999844 | 343.466 | 376.949 | 403.549 |
| 4.404999999999844 | 345.392 | 379.012 | 405.822 |
| 4.409999999999843 | 347.327 | 381.084 | 408.104 |
| 4.414999999999844 | 349.27 | 383.165 | 410.396 |
| 4.419999999999843 | 351.222 | 385.255 | 412.698 |
| 4.424999999999843 | 353.183 | 387.354 | 415.009 |
| 4.429999999999843 | 355.153 | 389.462 | 417.33 |
| 4.434999999999843 | 357.132 | 391.58 | 419.66 |
| 4.439999999999843 | 359.119 | 393.706 | 422 |
| 4.444999999999843 | 361.115 | 395.842 | 424.35 |
| 4.449999999999842 | 363.12 | 397.987 | 426.71 |
| 4.454999999999843 | 365.134 | 400.141 | 429.08 |
| 4.459999999999842 | 367.157 | 402.305 | 431.459 |
| 4.464999999999843 | 369.189 | 404.478 | 433.848 |
| 4.469999999999842 | 371.23 | 406.66 | 436.247 |
| 4.474999999999842 | 373.281 | 408.852 | 438.657 |
| 4.479999999999842 | 375.34 | 411.053 | 441.076 |
| 4.484999999999842 | 377.408 | 413.263 | 443.504 |
| 4.489999999999842 | 379.485 | 415.483 | 445.943 |
| 4.494999999999842 | 381.572 | 417.712 | 448.393 |
| 4.499999999999841 | 383.668 | 419.951 | 450.852 |
| 4.504999999999842 | 385.772 | 422.2 | 453.321 |
| 4.509999999999841 | 387.887 | 424.458 | 455.8 |
| 4.514999999999842 | 390.01 | 426.725 | 458.29 |
| 4.519999999999841 | 392.143 | 429.003 | 460.79 |
| 4.524999999999841 | 394.285 | 431.29 | 463.3 |
| 4.529999999999841 | 396.437 | 433.587 | 465.82 |
| 4.534999999999841 | 398.598 | 435.893 | 468.35 |
| 4.53999999999984 | 400.768 | 438.209 | 470.891 |
| 4.544999999999841 | 402.948 | 440.535 | 473.442 |
| 4.54999999999984 | 405.137 | 442.871 | 476.004 |
| 4.554999999999841 | 407.336 | 445.217 | 478.576 |
| 4.55999999999984 | 409.544 | 447.573 | 481.159 |
| 4.564999999999841 | 411.763 | 449.938 | 483.752 |
| 4.56999999999984 | 413.99 | 452.314 | 486.355 |
| 4.57499999999984 | 416.228 | 454.7 | 488.969 |
| 4.57999999999984 | 418.475 | 457.095 | 491.594 |
| 4.58499999999984 | 420.731 | 459.501 | 494.229 |
| 4.58999999999984 | 422.998 | 461.917 | 496.875 |
| 4.59499999999984 | 425.274 | 464.343 | 499.532 |
| 4.59999999999984 | 427.56 | 466.779 | 502.199 |
| 4.60499999999984 | 429.856 | 469.225 | 504.878 |
| 4.60999999999984 | 432.162 | 471.682 | 507.566 |
| 4.614999999999839 | 434.478 | 474.148 | 510.266 |
| 4.61999999999984 | 436.803 | 476.625 | 512.977 |
| 4.624999999999839 | 439.139 | 479.113 | 515.698 |
| 4.62999999999984 | 441.485 | 481.61 | 518.431 |
| 4.634999999999839 | 443.84 | 484.119 | 521.174 |
| 4.639999999999838 | 446.206 | 486.637 | 523.928 |
| 4.644999999999839 | 448.582 | 489.166 | 526.694 |
| 4.649999999999838 | 450.968 | 491.706 | 529.47 |
| 4.654999999999839 | 453.364 | 494.256 | 532.258 |
| 4.659999999999838 | 455.771 | 496.816 | 535.056 |
| 4.664999999999838 | 458.187 | 499.387 | 537.866 |
| 4.669999999999838 | 460.614 | 501.969 | 540.687 |
| 4.674999999999838 | 463.051 | 504.561 | 543.519 |
| 4.679999999999837 | 465.499 | 507.164 | 546.363 |
| 4.684999999999838 | 467.957 | 509.778 | 549.217 |
| 4.689999999999837 | 470.425 | 512.403 | 552.083 |
| 4.694999999999838 | 472.904 | 515.038 | 554.961 |
| 4.699999999999837 | 475.393 | 517.684 | 557.85 |
| 4.704999999999837 | 477.893 | 520.341 | 560.75 |
| 4.709999999999837 | 480.403 | 523.009 | 563.661 |
| 4.714999999999837 | 482.924 | 525.688 | 566.585 |
| 4.719999999999837 | 485.455 | 528.378 | 569.519 |
| 4.724999999999837 | 487.997 | 531.078 | 572.466 |
| 4.729999999999836 | 490.55 | 533.79 | 575.424 |
| 4.734999999999836 | 493.114 | 536.513 | 578.393 |
| 4.739999999999836 | 495.688 | 539.247 | 581.374 |
| 4.744999999999836 | 498.273 | 541.992 | 584.367 |
| 4.749999999999836 | 500.868 | 544.748 | 587.372 |
| 4.754999999999836 | 503.475 | 547.515 | 590.388 |
| 4.759999999999836 | 506.092 | 550.294 | 593.416 |
| 4.764999999999836 | 508.721 | 553.084 | 596.456 |
| 4.769999999999836 | 511.36 | 555.885 | 599.508 |
| 4.774999999999835 | 514.01 | 558.697 | 602.572 |
| 4.779999999999835 | 516.671 | 561.521 | 605.648 |
| 4.784999999999835 | 519.344 | 564.356 | 608.735 |
| 4.789999999999835 | 522.027 | 567.203 | 611.835 |
| 4.794999999999835 | 524.721 | 570.061 | 614.947 |
| 4.799999999999835 | 527.427 | 572.931 | 618.071 |
| 4.804999999999835 | 530.144 | 575.812 | 621.207 |
| 4.809999999999835 | 532.872 | 578.705 | 624.355 |
| 4.814999999999835 | 535.611 | 581.609 | 627.516 |
| 4.819999999999835 | 538.362 | 584.525 | 630.688 |
| 4.824999999999835 | 541.123 | 587.453 | 633.873 |
| 4.829999999999834 | 543.897 | 590.392 | 637.07 |
| 4.834999999999834 | 546.681 | 593.343 | 640.28 |
| 4.839999999999834 | 549.477 | 596.306 | 643.502 |
| 4.844999999999834 | 552.285 | 599.281 | 646.736 |
| 4.849999999999834 | 555.104 | 602.267 | 649.983 |
| 4.854999999999834 | 557.934 | 605.266 | 653.242 |
| 4.859999999999834 | 560.776 | 608.276 | 656.514 |
| 4.864999999999834 | 563.63 | 611.299 | 659.798 |
| 4.869999999999834 | 566.495 | 614.333 | 663.095 |
| 4.874999999999834 | 569.372 | 617.379 | 666.405 |
| 4.879999999999833 | 572.261 | 620.438 | 669.727 |
| 4.884999999999834 | 575.161 | 623.509 | 673.062 |
| 4.889999999999833 | 578.074 | 626.591 | 676.41 |
| 4.894999999999833 | 580.998 | 629.686 | 679.77 |
| 4.899999999999833 | 583.934 | 632.793 | 683.144 |
| 4.904999999999833 | 586.881 | 635.913 | 686.53 |
| 4.909999999999833 | 589.841 | 639.044 | 689.929 |
| 4.914999999999833 | 592.813 | 642.188 | 693.341 |
| 4.919999999999832 | 595.796 | 645.345 | 696.766 |
| 4.924999999999833 | 598.792 | 648.514 | 700.204 |
| 4.929999999999832 | 601.8 | 651.695 | 703.655 |
| 4.934999999999832 | 604.82 | 654.888 | 707.119 |
| 4.939999999999832 | 607.852 | 658.095 | 710.596 |
| 4.944999999999832 | 610.896 | 661.313 | 714.086 |
| 4.949999999999832 | 613.952 | 664.545 | 717.59 |
| 4.954999999999832 | 617.021 | 667.789 | 721.107 |
| 4.959999999999832 | 620.102 | 671.045 | 724.637 |
| 4.964999999999832 | 623.195 | 674.315 | 728.18 |
| 4.969999999999831 | 626.301 | 677.597 | 731.737 |
| 4.974999999999831 | 629.419 | 680.891 | 735.307 |
| 4.97999999999983 | 632.549 | 684.199 | 738.89 |
| 4.984999999999831 | 635.692 | 687.519 | 742.487 |
| 4.98999999999983 | 638.847 | 690.853 | 746.097 |
| 4.994999999999831 | 642.015 | 694.199 | 749.721 |
| 4.99999999999983 | 645.196 | 697.558 | 753.359 |